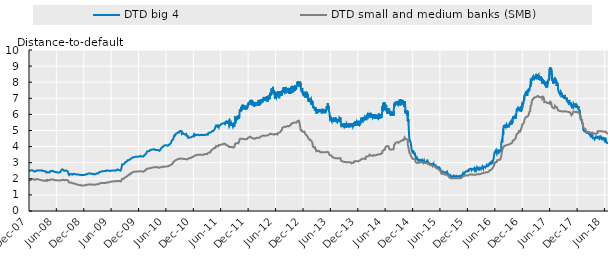
| Category | DTD big 4 | DTD small and medium banks (SMB) |
|---|---|---|
| 2007-12-31 | 2.468 | 1.886 |
| 2008-01-01 | 2.478 | 1.892 |
| 2008-01-02 | 2.49 | 1.893 |
| 2008-01-03 | 2.508 | 1.897 |
| 2008-01-04 | 2.509 | 1.9 |
| 2008-01-07 | 2.51 | 1.901 |
| 2008-01-08 | 2.519 | 1.912 |
| 2008-01-09 | 2.52 | 1.918 |
| 2008-01-10 | 2.529 | 1.926 |
| 2008-01-11 | 2.526 | 1.94 |
| 2008-01-14 | 2.529 | 1.942 |
| 2008-01-15 | 2.546 | 1.94 |
| 2008-01-16 | 2.539 | 1.954 |
| 2008-01-17 | 2.539 | 1.968 |
| 2008-01-18 | 2.542 | 1.975 |
| 2008-01-21 | 2.532 | 1.986 |
| 2008-01-22 | 2.498 | 1.968 |
| 2008-01-23 | 2.505 | 1.964 |
| 2008-01-24 | 2.515 | 1.976 |
| 2008-01-25 | 2.528 | 1.995 |
| 2008-01-28 | 2.492 | 1.979 |
| 2008-01-29 | 2.492 | 1.979 |
| 2008-01-30 | 2.489 | 1.968 |
| 2008-01-31 | 2.492 | 1.979 |
| 2008-02-01 | 2.488 | 1.978 |
| 2008-02-04 | 2.453 | 1.943 |
| 2008-02-05 | 2.459 | 1.944 |
| 2008-02-06 | 2.458 | 1.946 |
| 2008-02-07 | 2.459 | 1.947 |
| 2008-02-08 | 2.459 | 1.947 |
| 2008-02-11 | 2.459 | 1.947 |
| 2008-02-12 | 2.459 | 1.946 |
| 2008-02-13 | 2.455 | 1.939 |
| 2008-02-14 | 2.454 | 1.947 |
| 2008-02-15 | 2.5 | 1.985 |
| 2008-02-18 | 2.514 | 1.988 |
| 2008-02-19 | 2.516 | 1.99 |
| 2008-02-20 | 2.509 | 1.97 |
| 2008-02-21 | 2.51 | 1.97 |
| 2008-02-22 | 2.517 | 1.969 |
| 2008-02-25 | 2.509 | 1.966 |
| 2008-02-26 | 2.503 | 1.963 |
| 2008-02-27 | 2.506 | 1.957 |
| 2008-02-28 | 2.506 | 1.959 |
| 2008-02-29 | 2.508 | 1.958 |
| 2008-03-03 | 2.512 | 1.961 |
| 2008-03-04 | 2.506 | 1.946 |
| 2008-03-05 | 2.506 | 1.948 |
| 2008-03-06 | 2.528 | 1.967 |
| 2008-03-07 | 2.527 | 1.967 |
| 2008-03-10 | 2.521 | 1.948 |
| 2008-03-11 | 2.522 | 1.947 |
| 2008-03-12 | 2.519 | 1.936 |
| 2008-03-13 | 2.51 | 1.934 |
| 2008-03-14 | 2.509 | 1.931 |
| 2008-03-17 | 2.508 | 1.937 |
| 2008-03-18 | 2.533 | 1.939 |
| 2008-03-19 | 2.529 | 1.934 |
| 2008-03-20 | 2.532 | 1.929 |
| 2008-03-21 | 2.531 | 1.928 |
| 2008-03-24 | 2.528 | 1.907 |
| 2008-03-25 | 2.521 | 1.903 |
| 2008-03-26 | 2.523 | 1.901 |
| 2008-03-27 | 2.52 | 1.9 |
| 2008-03-28 | 2.494 | 1.882 |
| 2008-03-31 | 2.492 | 1.886 |
| 2008-04-01 | 2.489 | 1.887 |
| 2008-04-02 | 2.483 | 1.884 |
| 2008-04-03 | 2.479 | 1.89 |
| 2008-04-04 | 2.479 | 1.893 |
| 2008-04-07 | 2.48 | 1.892 |
| 2008-04-08 | 2.492 | 1.9 |
| 2008-04-09 | 2.479 | 1.887 |
| 2008-04-10 | 2.479 | 1.889 |
| 2008-04-11 | 2.479 | 1.89 |
| 2008-04-14 | 2.471 | 1.869 |
| 2008-04-15 | 2.47 | 1.919 |
| 2008-04-16 | 2.472 | 1.919 |
| 2008-04-17 | 2.469 | 1.919 |
| 2008-04-18 | 2.463 | 1.913 |
| 2008-04-21 | 2.454 | 1.913 |
| 2008-04-22 | 2.451 | 1.904 |
| 2008-04-23 | 2.446 | 1.892 |
| 2008-04-24 | 2.391 | 1.854 |
| 2008-04-25 | 2.379 | 1.854 |
| 2008-04-28 | 2.41 | 1.868 |
| 2008-04-29 | 2.408 | 1.868 |
| 2008-04-30 | 2.4 | 1.855 |
| 2008-05-01 | 2.401 | 1.93 |
| 2008-05-02 | 2.416 | 1.941 |
| 2008-05-05 | 2.416 | 1.941 |
| 2008-05-06 | 2.412 | 1.937 |
| 2008-05-07 | 2.406 | 1.928 |
| 2008-05-08 | 2.405 | 1.928 |
| 2008-05-09 | 2.402 | 1.918 |
| 2008-05-12 | 2.403 | 1.919 |
| 2008-05-13 | 2.401 | 1.917 |
| 2008-05-14 | 2.397 | 1.908 |
| 2008-05-15 | 2.396 | 1.906 |
| 2008-05-16 | 2.397 | 1.905 |
| 2008-05-19 | 2.425 | 1.924 |
| 2008-05-20 | 2.43 | 1.932 |
| 2008-05-21 | 2.43 | 1.934 |
| 2008-05-22 | 2.491 | 1.958 |
| 2008-05-23 | 2.494 | 1.962 |
| 2008-05-26 | 2.489 | 1.958 |
| 2008-05-27 | 2.489 | 1.957 |
| 2008-05-28 | 2.486 | 1.955 |
| 2008-05-29 | 2.484 | 1.953 |
| 2008-05-30 | 2.484 | 1.952 |
| 2008-06-02 | 2.497 | 1.956 |
| 2008-06-03 | 2.503 | 1.96 |
| 2008-06-04 | 2.501 | 1.961 |
| 2008-06-05 | 2.503 | 1.967 |
| 2008-06-06 | 2.503 | 1.969 |
| 2008-06-09 | 2.508 | 1.976 |
| 2008-06-10 | 2.454 | 1.934 |
| 2008-06-11 | 2.456 | 1.931 |
| 2008-06-12 | 2.455 | 1.932 |
| 2008-06-13 | 2.453 | 1.932 |
| 2008-06-16 | 2.455 | 1.937 |
| 2008-06-17 | 2.458 | 1.938 |
| 2008-06-18 | 2.452 | 1.934 |
| 2008-06-19 | 2.425 | 1.912 |
| 2008-06-20 | 2.419 | 1.909 |
| 2008-06-23 | 2.419 | 1.908 |
| 2008-06-24 | 2.423 | 1.913 |
| 2008-06-25 | 2.425 | 1.916 |
| 2008-06-26 | 2.427 | 1.921 |
| 2008-06-27 | 2.406 | 1.915 |
| 2008-06-30 | 2.406 | 1.914 |
| 2008-07-01 | 2.402 | 1.901 |
| 2008-07-02 | 2.402 | 1.902 |
| 2008-07-03 | 2.405 | 1.904 |
| 2008-07-04 | 2.408 | 1.915 |
| 2008-07-07 | 2.398 | 1.899 |
| 2008-07-08 | 2.398 | 1.899 |
| 2008-07-09 | 2.391 | 1.904 |
| 2008-07-10 | 2.395 | 1.907 |
| 2008-07-11 | 2.395 | 1.904 |
| 2008-07-14 | 2.4 | 1.921 |
| 2008-07-15 | 2.393 | 1.91 |
| 2008-07-16 | 2.39 | 1.904 |
| 2008-07-17 | 2.392 | 1.902 |
| 2008-07-18 | 2.387 | 1.891 |
| 2008-07-21 | 2.393 | 1.892 |
| 2008-07-22 | 2.392 | 1.899 |
| 2008-07-23 | 2.403 | 1.912 |
| 2008-07-24 | 2.399 | 1.906 |
| 2008-07-25 | 2.399 | 1.903 |
| 2008-07-28 | 2.457 | 1.906 |
| 2008-07-29 | 2.457 | 1.906 |
| 2008-07-30 | 2.459 | 1.91 |
| 2008-07-31 | 2.506 | 1.91 |
| 2008-08-01 | 2.505 | 1.906 |
| 2008-08-04 | 2.502 | 1.907 |
| 2008-08-05 | 2.517 | 1.914 |
| 2008-08-06 | 2.526 | 1.915 |
| 2008-08-07 | 2.586 | 1.936 |
| 2008-08-08 | 2.577 | 1.932 |
| 2008-08-11 | 2.568 | 1.929 |
| 2008-08-12 | 2.569 | 1.931 |
| 2008-08-13 | 2.565 | 1.937 |
| 2008-08-14 | 2.564 | 1.946 |
| 2008-08-15 | 2.569 | 1.947 |
| 2008-08-18 | 2.561 | 1.942 |
| 2008-08-19 | 2.564 | 1.94 |
| 2008-08-20 | 2.506 | 1.912 |
| 2008-08-21 | 2.498 | 1.906 |
| 2008-08-22 | 2.498 | 1.902 |
| 2008-08-25 | 2.498 | 1.903 |
| 2008-08-26 | 2.502 | 1.906 |
| 2008-08-27 | 2.505 | 1.909 |
| 2008-08-28 | 2.505 | 1.92 |
| 2008-08-29 | 2.524 | 1.936 |
| 2008-09-01 | 2.517 | 1.929 |
| 2008-09-02 | 2.516 | 1.932 |
| 2008-09-03 | 2.516 | 1.929 |
| 2008-09-04 | 2.518 | 1.93 |
| 2008-09-05 | 2.511 | 1.928 |
| 2008-09-08 | 2.511 | 1.928 |
| 2008-09-09 | 2.513 | 1.929 |
| 2008-09-10 | 2.513 | 1.93 |
| 2008-09-11 | 2.485 | 1.922 |
| 2008-09-12 | 2.506 | 1.922 |
| 2008-09-15 | 2.501 | 1.922 |
| 2008-09-16 | 2.438 | 1.884 |
| 2008-09-17 | 2.399 | 1.86 |
| 2008-09-18 | 2.38 | 1.854 |
| 2008-09-19 | 2.308 | 1.811 |
| 2008-09-22 | 2.249 | 1.77 |
| 2008-09-23 | 2.234 | 1.76 |
| 2008-09-24 | 2.247 | 1.758 |
| 2008-09-25 | 2.277 | 1.761 |
| 2008-09-26 | 2.274 | 1.764 |
| 2008-09-29 | 2.291 | 1.766 |
| 2008-09-30 | 2.286 | 1.779 |
| 2008-10-01 | 2.291 | 1.78 |
| 2008-10-02 | 2.292 | 1.784 |
| 2008-10-03 | 2.318 | 1.785 |
| 2008-10-06 | 2.293 | 1.763 |
| 2008-10-07 | 2.298 | 1.764 |
| 2008-10-08 | 2.281 | 1.753 |
| 2008-10-09 | 2.298 | 1.758 |
| 2008-10-10 | 2.306 | 1.759 |
| 2008-10-13 | 2.267 | 1.728 |
| 2008-10-14 | 2.258 | 1.73 |
| 2008-10-15 | 2.27 | 1.732 |
| 2008-10-16 | 2.273 | 1.731 |
| 2008-10-17 | 2.292 | 1.733 |
| 2008-10-20 | 2.294 | 1.728 |
| 2008-10-21 | 2.311 | 1.73 |
| 2008-10-22 | 2.305 | 1.73 |
| 2008-10-23 | 2.303 | 1.727 |
| 2008-10-24 | 2.301 | 1.719 |
| 2008-10-27 | 2.298 | 1.699 |
| 2008-10-28 | 2.293 | 1.69 |
| 2008-10-29 | 2.282 | 1.691 |
| 2008-10-30 | 2.279 | 1.69 |
| 2008-10-31 | 2.289 | 1.691 |
| 2008-11-03 | 2.3 | 1.692 |
| 2008-11-04 | 2.287 | 1.69 |
| 2008-11-05 | 2.285 | 1.684 |
| 2008-11-06 | 2.297 | 1.677 |
| 2008-11-07 | 2.282 | 1.672 |
| 2008-11-10 | 2.257 | 1.653 |
| 2008-11-11 | 2.268 | 1.653 |
| 2008-11-12 | 2.275 | 1.654 |
| 2008-11-13 | 2.269 | 1.651 |
| 2008-11-14 | 2.252 | 1.649 |
| 2008-11-17 | 2.265 | 1.65 |
| 2008-11-18 | 2.275 | 1.641 |
| 2008-11-19 | 2.271 | 1.624 |
| 2008-11-20 | 2.274 | 1.623 |
| 2008-11-21 | 2.26 | 1.625 |
| 2008-11-24 | 2.273 | 1.62 |
| 2008-11-25 | 2.257 | 1.621 |
| 2008-11-26 | 2.263 | 1.622 |
| 2008-11-27 | 2.259 | 1.62 |
| 2008-11-28 | 2.25 | 1.615 |
| 2008-12-01 | 2.25 | 1.617 |
| 2008-12-02 | 2.257 | 1.618 |
| 2008-12-03 | 2.239 | 1.61 |
| 2008-12-04 | 2.249 | 1.614 |
| 2008-12-05 | 2.254 | 1.612 |
| 2008-12-08 | 2.251 | 1.604 |
| 2008-12-09 | 2.238 | 1.607 |
| 2008-12-10 | 2.24 | 1.596 |
| 2008-12-11 | 2.238 | 1.593 |
| 2008-12-12 | 2.236 | 1.588 |
| 2008-12-15 | 2.225 | 1.587 |
| 2008-12-16 | 2.235 | 1.591 |
| 2008-12-17 | 2.232 | 1.592 |
| 2008-12-18 | 2.236 | 1.583 |
| 2008-12-19 | 2.24 | 1.582 |
| 2008-12-22 | 2.231 | 1.584 |
| 2008-12-23 | 2.232 | 1.582 |
| 2008-12-24 | 2.225 | 1.58 |
| 2008-12-25 | 2.229 | 1.582 |
| 2008-12-26 | 2.229 | 1.583 |
| 2008-12-29 | 2.226 | 1.581 |
| 2008-12-30 | 2.239 | 1.583 |
| 2008-12-31 | 2.235 | 1.589 |
| 2009-01-01 | 2.232 | 1.59 |
| 2009-01-02 | 2.246 | 1.592 |
| 2009-01-05 | 2.245 | 1.591 |
| 2009-01-06 | 2.244 | 1.589 |
| 2009-01-07 | 2.243 | 1.588 |
| 2009-01-08 | 2.24 | 1.592 |
| 2009-01-09 | 2.265 | 1.609 |
| 2009-01-12 | 2.284 | 1.611 |
| 2009-01-13 | 2.284 | 1.612 |
| 2009-01-14 | 2.279 | 1.605 |
| 2009-01-15 | 2.292 | 1.621 |
| 2009-01-16 | 2.285 | 1.62 |
| 2009-01-19 | 2.293 | 1.622 |
| 2009-01-20 | 2.281 | 1.621 |
| 2009-01-21 | 2.297 | 1.62 |
| 2009-01-22 | 2.325 | 1.646 |
| 2009-01-23 | 2.32 | 1.645 |
| 2009-01-26 | 2.333 | 1.644 |
| 2009-01-27 | 2.321 | 1.643 |
| 2009-01-28 | 2.33 | 1.644 |
| 2009-01-29 | 2.325 | 1.644 |
| 2009-01-30 | 2.33 | 1.643 |
| 2009-02-02 | 2.334 | 1.649 |
| 2009-02-03 | 2.326 | 1.643 |
| 2009-02-04 | 2.33 | 1.636 |
| 2009-02-05 | 2.325 | 1.641 |
| 2009-02-06 | 2.324 | 1.636 |
| 2009-02-09 | 2.333 | 1.641 |
| 2009-02-10 | 2.323 | 1.647 |
| 2009-02-11 | 2.323 | 1.649 |
| 2009-02-12 | 2.334 | 1.653 |
| 2009-02-13 | 2.327 | 1.652 |
| 2009-02-16 | 2.318 | 1.646 |
| 2009-02-17 | 2.326 | 1.646 |
| 2009-02-18 | 2.306 | 1.638 |
| 2009-02-19 | 2.309 | 1.642 |
| 2009-02-20 | 2.308 | 1.645 |
| 2009-02-23 | 2.312 | 1.643 |
| 2009-02-24 | 2.3 | 1.635 |
| 2009-02-25 | 2.296 | 1.629 |
| 2009-02-26 | 2.305 | 1.632 |
| 2009-02-27 | 2.296 | 1.632 |
| 2009-03-02 | 2.296 | 1.638 |
| 2009-03-03 | 2.302 | 1.636 |
| 2009-03-04 | 2.281 | 1.62 |
| 2009-03-05 | 2.282 | 1.623 |
| 2009-03-06 | 2.272 | 1.625 |
| 2009-03-09 | 2.271 | 1.626 |
| 2009-03-10 | 2.271 | 1.632 |
| 2009-03-11 | 2.265 | 1.628 |
| 2009-03-12 | 2.285 | 1.636 |
| 2009-03-13 | 2.284 | 1.637 |
| 2009-03-16 | 2.273 | 1.635 |
| 2009-03-17 | 2.287 | 1.634 |
| 2009-03-18 | 2.32 | 1.651 |
| 2009-03-19 | 2.322 | 1.653 |
| 2009-03-20 | 2.325 | 1.65 |
| 2009-03-23 | 2.321 | 1.659 |
| 2009-03-24 | 2.338 | 1.66 |
| 2009-03-25 | 2.321 | 1.66 |
| 2009-03-26 | 2.311 | 1.65 |
| 2009-03-27 | 2.321 | 1.65 |
| 2009-03-30 | 2.322 | 1.661 |
| 2009-03-31 | 2.327 | 1.666 |
| 2009-04-01 | 2.329 | 1.664 |
| 2009-04-02 | 2.339 | 1.677 |
| 2009-04-03 | 2.345 | 1.675 |
| 2009-04-06 | 2.344 | 1.674 |
| 2009-04-07 | 2.352 | 1.682 |
| 2009-04-08 | 2.348 | 1.678 |
| 2009-04-09 | 2.346 | 1.678 |
| 2009-04-10 | 2.353 | 1.684 |
| 2009-04-13 | 2.366 | 1.693 |
| 2009-04-14 | 2.426 | 1.721 |
| 2009-04-15 | 2.429 | 1.723 |
| 2009-04-16 | 2.428 | 1.725 |
| 2009-04-17 | 2.435 | 1.724 |
| 2009-04-20 | 2.451 | 1.734 |
| 2009-04-21 | 2.435 | 1.733 |
| 2009-04-22 | 2.451 | 1.73 |
| 2009-04-23 | 2.448 | 1.73 |
| 2009-04-24 | 2.448 | 1.731 |
| 2009-04-27 | 2.454 | 1.739 |
| 2009-04-28 | 2.458 | 1.738 |
| 2009-04-29 | 2.455 | 1.724 |
| 2009-04-30 | 2.46 | 1.724 |
| 2009-05-01 | 2.455 | 1.728 |
| 2009-05-04 | 2.46 | 1.736 |
| 2009-05-05 | 2.467 | 1.736 |
| 2009-05-06 | 2.458 | 1.736 |
| 2009-05-07 | 2.461 | 1.733 |
| 2009-05-08 | 2.46 | 1.739 |
| 2009-05-11 | 2.462 | 1.738 |
| 2009-05-12 | 2.47 | 1.738 |
| 2009-05-13 | 2.462 | 1.737 |
| 2009-05-14 | 2.481 | 1.741 |
| 2009-05-15 | 2.473 | 1.738 |
| 2009-05-18 | 2.481 | 1.745 |
| 2009-05-19 | 2.485 | 1.745 |
| 2009-05-20 | 2.478 | 1.743 |
| 2009-05-21 | 2.474 | 1.745 |
| 2009-05-22 | 2.473 | 1.744 |
| 2009-05-25 | 2.474 | 1.746 |
| 2009-05-26 | 2.484 | 1.744 |
| 2009-05-27 | 2.468 | 1.738 |
| 2009-05-28 | 2.485 | 1.739 |
| 2009-05-29 | 2.536 | 1.775 |
| 2009-06-01 | 2.526 | 1.773 |
| 2009-06-02 | 2.524 | 1.772 |
| 2009-06-03 | 2.506 | 1.761 |
| 2009-06-04 | 2.502 | 1.761 |
| 2009-06-05 | 2.501 | 1.763 |
| 2009-06-08 | 2.494 | 1.767 |
| 2009-06-09 | 2.511 | 1.786 |
| 2009-06-10 | 2.522 | 1.791 |
| 2009-06-11 | 2.526 | 1.791 |
| 2009-06-12 | 2.527 | 1.791 |
| 2009-06-15 | 2.494 | 1.782 |
| 2009-06-16 | 2.498 | 1.783 |
| 2009-06-17 | 2.525 | 1.793 |
| 2009-06-18 | 2.517 | 1.791 |
| 2009-06-19 | 2.516 | 1.801 |
| 2009-06-22 | 2.496 | 1.801 |
| 2009-06-23 | 2.487 | 1.8 |
| 2009-06-24 | 2.486 | 1.801 |
| 2009-06-25 | 2.492 | 1.815 |
| 2009-06-26 | 2.492 | 1.815 |
| 2009-06-29 | 2.504 | 1.822 |
| 2009-06-30 | 2.502 | 1.822 |
| 2009-07-01 | 2.501 | 1.817 |
| 2009-07-02 | 2.507 | 1.815 |
| 2009-07-03 | 2.51 | 1.827 |
| 2009-07-06 | 2.512 | 1.831 |
| 2009-07-07 | 2.515 | 1.832 |
| 2009-07-08 | 2.512 | 1.841 |
| 2009-07-09 | 2.516 | 1.84 |
| 2009-07-10 | 2.507 | 1.841 |
| 2009-07-13 | 2.507 | 1.84 |
| 2009-07-14 | 2.508 | 1.842 |
| 2009-07-15 | 2.518 | 1.842 |
| 2009-07-16 | 2.519 | 1.838 |
| 2009-07-17 | 2.511 | 1.841 |
| 2009-07-20 | 2.521 | 1.841 |
| 2009-07-21 | 2.516 | 1.843 |
| 2009-07-22 | 2.522 | 1.847 |
| 2009-07-23 | 2.523 | 1.843 |
| 2009-07-24 | 2.52 | 1.842 |
| 2009-07-27 | 2.522 | 1.844 |
| 2009-07-28 | 2.522 | 1.843 |
| 2009-07-29 | 2.524 | 1.85 |
| 2009-07-30 | 2.523 | 1.844 |
| 2009-07-31 | 2.518 | 1.844 |
| 2009-08-03 | 2.526 | 1.848 |
| 2009-08-04 | 2.521 | 1.844 |
| 2009-08-05 | 2.514 | 1.842 |
| 2009-08-06 | 2.526 | 1.847 |
| 2009-08-07 | 2.533 | 1.847 |
| 2009-08-10 | 2.585 | 1.873 |
| 2009-08-11 | 2.588 | 1.878 |
| 2009-08-12 | 2.577 | 1.874 |
| 2009-08-13 | 2.567 | 1.872 |
| 2009-08-14 | 2.568 | 1.869 |
| 2009-08-17 | 2.551 | 1.859 |
| 2009-08-18 | 2.548 | 1.858 |
| 2009-08-19 | 2.541 | 1.853 |
| 2009-08-20 | 2.54 | 1.855 |
| 2009-08-21 | 2.54 | 1.857 |
| 2009-08-24 | 2.536 | 1.858 |
| 2009-08-25 | 2.524 | 1.845 |
| 2009-08-26 | 2.54 | 1.851 |
| 2009-08-27 | 2.532 | 1.852 |
| 2009-08-28 | 2.537 | 1.844 |
| 2009-08-31 | 2.508 | 1.831 |
| 2009-09-01 | 2.517 | 1.839 |
| 2009-09-02 | 2.524 | 1.832 |
| 2009-09-03 | 2.502 | 1.829 |
| 2009-09-04 | 2.594 | 1.865 |
| 2009-09-07 | 2.675 | 1.9 |
| 2009-09-08 | 2.676 | 1.902 |
| 2009-09-09 | 2.77 | 1.945 |
| 2009-09-10 | 2.889 | 1.99 |
| 2009-09-11 | 2.885 | 1.999 |
| 2009-09-14 | 2.886 | 2 |
| 2009-09-15 | 2.896 | 2.003 |
| 2009-09-16 | 2.888 | 1.996 |
| 2009-09-17 | 2.894 | 1.999 |
| 2009-09-18 | 2.878 | 1.99 |
| 2009-09-21 | 2.868 | 1.989 |
| 2009-09-22 | 2.866 | 1.982 |
| 2009-09-23 | 2.877 | 1.983 |
| 2009-09-24 | 2.925 | 2.017 |
| 2009-09-25 | 2.922 | 2.017 |
| 2009-09-28 | 2.922 | 2.031 |
| 2009-09-29 | 2.927 | 2.031 |
| 2009-09-30 | 2.947 | 2.04 |
| 2009-10-01 | 3.019 | 2.085 |
| 2009-10-02 | 3.036 | 2.089 |
| 2009-10-05 | 3.025 | 2.094 |
| 2009-10-06 | 3.047 | 2.106 |
| 2009-10-07 | 3.061 | 2.104 |
| 2009-10-08 | 3.058 | 2.114 |
| 2009-10-09 | 3.048 | 2.109 |
| 2009-10-12 | 3.05 | 2.109 |
| 2009-10-13 | 3.068 | 2.115 |
| 2009-10-14 | 3.079 | 2.138 |
| 2009-10-15 | 3.094 | 2.182 |
| 2009-10-16 | 3.114 | 2.208 |
| 2009-10-19 | 3.158 | 2.21 |
| 2009-10-20 | 3.151 | 2.211 |
| 2009-10-21 | 3.165 | 2.217 |
| 2009-10-22 | 3.153 | 2.217 |
| 2009-10-23 | 3.152 | 2.21 |
| 2009-10-26 | 3.163 | 2.229 |
| 2009-10-27 | 3.149 | 2.232 |
| 2009-10-28 | 3.159 | 2.236 |
| 2009-10-29 | 3.212 | 2.278 |
| 2009-10-30 | 3.201 | 2.279 |
| 2009-11-02 | 3.203 | 2.269 |
| 2009-11-03 | 3.214 | 2.274 |
| 2009-11-04 | 3.211 | 2.276 |
| 2009-11-05 | 3.22 | 2.278 |
| 2009-11-06 | 3.242 | 2.328 |
| 2009-11-09 | 3.258 | 2.36 |
| 2009-11-10 | 3.268 | 2.367 |
| 2009-11-11 | 3.267 | 2.367 |
| 2009-11-12 | 3.301 | 2.386 |
| 2009-11-13 | 3.287 | 2.386 |
| 2009-11-16 | 3.283 | 2.379 |
| 2009-11-17 | 3.281 | 2.377 |
| 2009-11-18 | 3.302 | 2.402 |
| 2009-11-19 | 3.307 | 2.403 |
| 2009-11-20 | 3.306 | 2.4 |
| 2009-11-23 | 3.332 | 2.42 |
| 2009-11-24 | 3.328 | 2.411 |
| 2009-11-25 | 3.324 | 2.41 |
| 2009-11-26 | 3.303 | 2.415 |
| 2009-11-27 | 3.331 | 2.416 |
| 2009-11-30 | 3.339 | 2.439 |
| 2009-12-01 | 3.356 | 2.448 |
| 2009-12-02 | 3.372 | 2.469 |
| 2009-12-03 | 3.371 | 2.471 |
| 2009-12-04 | 3.349 | 2.442 |
| 2009-12-07 | 3.362 | 2.441 |
| 2009-12-08 | 3.358 | 2.453 |
| 2009-12-09 | 3.361 | 2.448 |
| 2009-12-10 | 3.369 | 2.453 |
| 2009-12-11 | 3.379 | 2.466 |
| 2009-12-14 | 3.364 | 2.453 |
| 2009-12-15 | 3.364 | 2.451 |
| 2009-12-16 | 3.367 | 2.451 |
| 2009-12-17 | 3.366 | 2.449 |
| 2009-12-18 | 3.364 | 2.446 |
| 2009-12-21 | 3.375 | 2.447 |
| 2009-12-22 | 3.361 | 2.441 |
| 2009-12-23 | 3.37 | 2.443 |
| 2009-12-24 | 3.356 | 2.454 |
| 2009-12-25 | 3.361 | 2.457 |
| 2009-12-28 | 3.377 | 2.455 |
| 2009-12-29 | 3.386 | 2.466 |
| 2009-12-30 | 3.389 | 2.45 |
| 2009-12-31 | 3.388 | 2.452 |
| 2010-01-01 | 3.403 | 2.456 |
| 2010-01-04 | 3.391 | 2.472 |
| 2010-01-05 | 3.418 | 2.471 |
| 2010-01-06 | 3.415 | 2.473 |
| 2010-01-07 | 3.426 | 2.474 |
| 2010-01-08 | 3.432 | 2.475 |
| 2010-01-11 | 3.422 | 2.476 |
| 2010-01-12 | 3.423 | 2.476 |
| 2010-01-13 | 3.384 | 2.448 |
| 2010-01-14 | 3.38 | 2.451 |
| 2010-01-15 | 3.39 | 2.45 |
| 2010-01-18 | 3.385 | 2.452 |
| 2010-01-19 | 3.386 | 2.451 |
| 2010-01-20 | 3.374 | 2.442 |
| 2010-01-21 | 3.365 | 2.436 |
| 2010-01-22 | 3.378 | 2.436 |
| 2010-01-25 | 3.379 | 2.451 |
| 2010-01-26 | 3.372 | 2.45 |
| 2010-01-27 | 3.403 | 2.447 |
| 2010-01-28 | 3.388 | 2.447 |
| 2010-01-29 | 3.395 | 2.445 |
| 2010-02-01 | 3.395 | 2.442 |
| 2010-02-02 | 3.401 | 2.451 |
| 2010-02-03 | 3.392 | 2.447 |
| 2010-02-04 | 3.422 | 2.463 |
| 2010-02-05 | 3.438 | 2.469 |
| 2010-02-08 | 3.492 | 2.492 |
| 2010-02-09 | 3.489 | 2.49 |
| 2010-02-10 | 3.483 | 2.491 |
| 2010-02-11 | 3.491 | 2.501 |
| 2010-02-12 | 3.531 | 2.536 |
| 2010-02-15 | 3.521 | 2.548 |
| 2010-02-16 | 3.531 | 2.56 |
| 2010-02-17 | 3.547 | 2.56 |
| 2010-02-18 | 3.534 | 2.564 |
| 2010-02-19 | 3.547 | 2.569 |
| 2010-02-22 | 3.642 | 2.616 |
| 2010-02-23 | 3.653 | 2.619 |
| 2010-02-24 | 3.665 | 2.622 |
| 2010-02-25 | 3.706 | 2.627 |
| 2010-02-26 | 3.701 | 2.627 |
| 2010-03-01 | 3.709 | 2.629 |
| 2010-03-02 | 3.709 | 2.634 |
| 2010-03-03 | 3.703 | 2.634 |
| 2010-03-04 | 3.711 | 2.638 |
| 2010-03-05 | 3.716 | 2.647 |
| 2010-03-08 | 3.716 | 2.652 |
| 2010-03-09 | 3.717 | 2.647 |
| 2010-03-10 | 3.714 | 2.652 |
| 2010-03-11 | 3.718 | 2.654 |
| 2010-03-12 | 3.723 | 2.652 |
| 2010-03-15 | 3.715 | 2.649 |
| 2010-03-16 | 3.788 | 2.672 |
| 2010-03-17 | 3.788 | 2.672 |
| 2010-03-18 | 3.793 | 2.671 |
| 2010-03-19 | 3.778 | 2.673 |
| 2010-03-22 | 3.8 | 2.671 |
| 2010-03-23 | 3.802 | 2.675 |
| 2010-03-24 | 3.792 | 2.689 |
| 2010-03-25 | 3.798 | 2.688 |
| 2010-03-26 | 3.804 | 2.683 |
| 2010-03-29 | 3.818 | 2.691 |
| 2010-03-30 | 3.815 | 2.695 |
| 2010-03-31 | 3.816 | 2.702 |
| 2010-04-01 | 3.829 | 2.704 |
| 2010-04-02 | 3.822 | 2.704 |
| 2010-04-05 | 3.83 | 2.704 |
| 2010-04-06 | 3.823 | 2.706 |
| 2010-04-07 | 3.834 | 2.709 |
| 2010-04-08 | 3.827 | 2.711 |
| 2010-04-09 | 3.827 | 2.717 |
| 2010-04-12 | 3.833 | 2.722 |
| 2010-04-13 | 3.838 | 2.716 |
| 2010-04-14 | 3.828 | 2.718 |
| 2010-04-15 | 3.844 | 2.726 |
| 2010-04-16 | 3.82 | 2.717 |
| 2010-04-19 | 3.796 | 2.723 |
| 2010-04-20 | 3.791 | 2.725 |
| 2010-04-21 | 3.784 | 2.721 |
| 2010-04-22 | 3.775 | 2.714 |
| 2010-04-23 | 3.778 | 2.716 |
| 2010-04-26 | 3.788 | 2.716 |
| 2010-04-27 | 3.79 | 2.717 |
| 2010-04-28 | 3.782 | 2.727 |
| 2010-04-29 | 3.81 | 2.728 |
| 2010-04-30 | 3.792 | 2.731 |
| 2010-05-03 | 3.772 | 2.735 |
| 2010-05-04 | 3.791 | 2.735 |
| 2010-05-05 | 3.795 | 2.733 |
| 2010-05-06 | 3.767 | 2.693 |
| 2010-05-07 | 3.779 | 2.694 |
| 2010-05-10 | 3.785 | 2.691 |
| 2010-05-11 | 3.773 | 2.691 |
| 2010-05-12 | 3.765 | 2.681 |
| 2010-05-13 | 3.757 | 2.675 |
| 2010-05-14 | 3.772 | 2.679 |
| 2010-05-17 | 3.752 | 2.681 |
| 2010-05-18 | 3.741 | 2.673 |
| 2010-05-19 | 3.759 | 2.669 |
| 2010-05-20 | 3.781 | 2.686 |
| 2010-05-21 | 3.768 | 2.681 |
| 2010-05-24 | 3.81 | 2.721 |
| 2010-05-25 | 3.813 | 2.716 |
| 2010-05-26 | 3.811 | 2.719 |
| 2010-05-27 | 3.873 | 2.726 |
| 2010-05-28 | 3.87 | 2.725 |
| 2010-05-31 | 3.859 | 2.72 |
| 2010-06-01 | 3.87 | 2.723 |
| 2010-06-02 | 3.86 | 2.724 |
| 2010-06-03 | 3.953 | 2.763 |
| 2010-06-04 | 3.945 | 2.76 |
| 2010-06-07 | 3.932 | 2.757 |
| 2010-06-08 | 3.952 | 2.761 |
| 2010-06-09 | 3.948 | 2.728 |
| 2010-06-10 | 3.977 | 2.723 |
| 2010-06-11 | 4.034 | 2.727 |
| 2010-06-14 | 4.036 | 2.734 |
| 2010-06-15 | 4.053 | 2.735 |
| 2010-06-16 | 4.055 | 2.737 |
| 2010-06-17 | 4.055 | 2.744 |
| 2010-06-18 | 4.078 | 2.744 |
| 2010-06-21 | 4.065 | 2.751 |
| 2010-06-22 | 4.079 | 2.755 |
| 2010-06-23 | 4.077 | 2.759 |
| 2010-06-24 | 4.081 | 2.763 |
| 2010-06-25 | 4.089 | 2.77 |
| 2010-06-28 | 4.107 | 2.771 |
| 2010-06-29 | 4.086 | 2.748 |
| 2010-06-30 | 4.078 | 2.748 |
| 2010-07-01 | 4.091 | 2.754 |
| 2010-07-02 | 4.097 | 2.771 |
| 2010-07-05 | 4.082 | 2.77 |
| 2010-07-06 | 4.07 | 2.779 |
| 2010-07-07 | 4.074 | 2.777 |
| 2010-07-08 | 4.065 | 2.775 |
| 2010-07-09 | 4.037 | 2.771 |
| 2010-07-12 | 4.049 | 2.773 |
| 2010-07-13 | 4.052 | 2.786 |
| 2010-07-14 | 4.051 | 2.792 |
| 2010-07-15 | 4.064 | 2.793 |
| 2010-07-16 | 4.041 | 2.791 |
| 2010-07-19 | 4.051 | 2.799 |
| 2010-07-20 | 4.122 | 2.827 |
| 2010-07-21 | 4.128 | 2.827 |
| 2010-07-22 | 4.12 | 2.826 |
| 2010-07-23 | 4.134 | 2.832 |
| 2010-07-26 | 4.134 | 2.838 |
| 2010-07-27 | 4.155 | 2.842 |
| 2010-07-28 | 4.14 | 2.839 |
| 2010-07-29 | 4.167 | 2.844 |
| 2010-07-30 | 4.132 | 2.842 |
| 2010-08-02 | 4.19 | 2.856 |
| 2010-08-03 | 4.232 | 2.856 |
| 2010-08-04 | 4.24 | 2.868 |
| 2010-08-05 | 4.312 | 2.893 |
| 2010-08-06 | 4.323 | 2.892 |
| 2010-08-09 | 4.325 | 2.912 |
| 2010-08-10 | 4.373 | 2.925 |
| 2010-08-11 | 4.411 | 2.925 |
| 2010-08-12 | 4.391 | 2.923 |
| 2010-08-13 | 4.446 | 2.972 |
| 2010-08-16 | 4.428 | 2.971 |
| 2010-08-17 | 4.445 | 2.97 |
| 2010-08-18 | 4.452 | 2.992 |
| 2010-08-19 | 4.55 | 3.05 |
| 2010-08-20 | 4.565 | 3.061 |
| 2010-08-23 | 4.617 | 3.083 |
| 2010-08-24 | 4.693 | 3.108 |
| 2010-08-25 | 4.682 | 3.096 |
| 2010-08-26 | 4.658 | 3.097 |
| 2010-08-27 | 4.693 | 3.109 |
| 2010-08-30 | 4.708 | 3.108 |
| 2010-08-31 | 4.686 | 3.104 |
| 2010-09-01 | 4.752 | 3.145 |
| 2010-09-02 | 4.77 | 3.151 |
| 2010-09-03 | 4.765 | 3.152 |
| 2010-09-06 | 4.783 | 3.153 |
| 2010-09-07 | 4.818 | 3.156 |
| 2010-09-08 | 4.819 | 3.175 |
| 2010-09-09 | 4.843 | 3.177 |
| 2010-09-10 | 4.844 | 3.187 |
| 2010-09-13 | 4.822 | 3.19 |
| 2010-09-14 | 4.837 | 3.215 |
| 2010-09-15 | 4.843 | 3.215 |
| 2010-09-16 | 4.87 | 3.22 |
| 2010-09-17 | 4.895 | 3.225 |
| 2010-09-20 | 4.881 | 3.224 |
| 2010-09-21 | 4.893 | 3.226 |
| 2010-09-22 | 4.881 | 3.224 |
| 2010-09-23 | 4.867 | 3.227 |
| 2010-09-24 | 4.895 | 3.225 |
| 2010-09-27 | 4.875 | 3.223 |
| 2010-09-28 | 4.871 | 3.218 |
| 2010-09-29 | 4.933 | 3.26 |
| 2010-09-30 | 4.956 | 3.252 |
| 2010-10-01 | 4.956 | 3.264 |
| 2010-10-04 | 4.973 | 3.262 |
| 2010-10-05 | 4.967 | 3.262 |
| 2010-10-06 | 4.94 | 3.266 |
| 2010-10-07 | 4.973 | 3.273 |
| 2010-10-08 | 4.973 | 3.263 |
| 2010-10-11 | 4.942 | 3.249 |
| 2010-10-12 | 4.971 | 3.245 |
| 2010-10-13 | 4.962 | 3.244 |
| 2010-10-14 | 4.942 | 3.248 |
| 2010-10-15 | 4.789 | 3.2 |
| 2010-10-18 | 4.769 | 3.199 |
| 2010-10-19 | 4.797 | 3.211 |
| 2010-10-20 | 4.802 | 3.215 |
| 2010-10-21 | 4.847 | 3.239 |
| 2010-10-22 | 4.83 | 3.239 |
| 2010-10-25 | 4.82 | 3.234 |
| 2010-10-26 | 4.805 | 3.239 |
| 2010-10-27 | 4.828 | 3.232 |
| 2010-10-28 | 4.806 | 3.232 |
| 2010-10-29 | 4.782 | 3.221 |
| 2010-11-01 | 4.795 | 3.225 |
| 2010-11-02 | 4.761 | 3.227 |
| 2010-11-03 | 4.752 | 3.221 |
| 2010-11-04 | 4.775 | 3.231 |
| 2010-11-05 | 4.746 | 3.239 |
| 2010-11-08 | 4.757 | 3.232 |
| 2010-11-09 | 4.742 | 3.229 |
| 2010-11-10 | 4.78 | 3.216 |
| 2010-11-11 | 4.776 | 3.213 |
| 2010-11-12 | 4.785 | 3.172 |
| 2010-11-15 | 4.671 | 3.17 |
| 2010-11-16 | 4.654 | 3.19 |
| 2010-11-17 | 4.657 | 3.202 |
| 2010-11-18 | 4.69 | 3.206 |
| 2010-11-19 | 4.688 | 3.21 |
| 2010-11-22 | 4.658 | 3.199 |
| 2010-11-23 | 4.674 | 3.2 |
| 2010-11-24 | 4.55 | 3.254 |
| 2010-11-25 | 4.562 | 3.246 |
| 2010-11-26 | 4.573 | 3.25 |
| 2010-11-29 | 4.589 | 3.262 |
| 2010-11-30 | 4.572 | 3.259 |
| 2010-12-01 | 4.562 | 3.259 |
| 2010-12-02 | 4.558 | 3.283 |
| 2010-12-03 | 4.546 | 3.283 |
| 2010-12-06 | 4.554 | 3.282 |
| 2010-12-07 | 4.568 | 3.288 |
| 2010-12-08 | 4.564 | 3.291 |
| 2010-12-09 | 4.562 | 3.289 |
| 2010-12-10 | 4.585 | 3.303 |
| 2010-12-13 | 4.573 | 3.291 |
| 2010-12-14 | 4.575 | 3.304 |
| 2010-12-15 | 4.58 | 3.309 |
| 2010-12-16 | 4.582 | 3.314 |
| 2010-12-17 | 4.604 | 3.321 |
| 2010-12-20 | 4.608 | 3.366 |
| 2010-12-21 | 4.635 | 3.356 |
| 2010-12-22 | 4.619 | 3.349 |
| 2010-12-23 | 4.637 | 3.354 |
| 2010-12-24 | 4.645 | 3.36 |
| 2010-12-27 | 4.629 | 3.362 |
| 2010-12-28 | 4.643 | 3.374 |
| 2010-12-29 | 4.629 | 3.374 |
| 2010-12-30 | 4.637 | 3.374 |
| 2010-12-31 | 4.654 | 3.373 |
| 2011-01-03 | 4.753 | 3.43 |
| 2011-01-04 | 4.74 | 3.431 |
| 2011-01-05 | 4.735 | 3.431 |
| 2011-01-06 | 4.742 | 3.43 |
| 2011-01-07 | 4.677 | 3.411 |
| 2011-01-10 | 4.692 | 3.422 |
| 2011-01-11 | 4.711 | 3.425 |
| 2011-01-12 | 4.742 | 3.446 |
| 2011-01-13 | 4.735 | 3.458 |
| 2011-01-14 | 4.733 | 3.465 |
| 2011-01-17 | 4.717 | 3.467 |
| 2011-01-18 | 4.692 | 3.471 |
| 2011-01-19 | 4.704 | 3.475 |
| 2011-01-20 | 4.686 | 3.469 |
| 2011-01-21 | 4.715 | 3.463 |
| 2011-01-24 | 4.73 | 3.49 |
| 2011-01-25 | 4.71 | 3.489 |
| 2011-01-26 | 4.734 | 3.489 |
| 2011-01-27 | 4.747 | 3.499 |
| 2011-01-28 | 4.733 | 3.494 |
| 2011-01-31 | 4.721 | 3.504 |
| 2011-02-01 | 4.706 | 3.503 |
| 2011-02-02 | 4.734 | 3.5 |
| 2011-02-03 | 4.725 | 3.499 |
| 2011-02-04 | 4.707 | 3.503 |
| 2011-02-07 | 4.739 | 3.5 |
| 2011-02-08 | 4.716 | 3.502 |
| 2011-02-09 | 4.707 | 3.496 |
| 2011-02-10 | 4.716 | 3.499 |
| 2011-02-11 | 4.707 | 3.501 |
| 2011-02-14 | 4.714 | 3.479 |
| 2011-02-15 | 4.719 | 3.49 |
| 2011-02-16 | 4.715 | 3.494 |
| 2011-02-17 | 4.722 | 3.5 |
| 2011-02-18 | 4.72 | 3.5 |
| 2011-02-21 | 4.714 | 3.499 |
| 2011-02-22 | 4.74 | 3.496 |
| 2011-02-23 | 4.736 | 3.495 |
| 2011-02-24 | 4.703 | 3.499 |
| 2011-02-25 | 4.717 | 3.503 |
| 2011-02-28 | 4.731 | 3.5 |
| 2011-03-01 | 4.732 | 3.5 |
| 2011-03-02 | 4.722 | 3.499 |
| 2011-03-03 | 4.726 | 3.497 |
| 2011-03-04 | 4.714 | 3.501 |
| 2011-03-07 | 4.742 | 3.508 |
| 2011-03-08 | 4.733 | 3.507 |
| 2011-03-09 | 4.725 | 3.508 |
| 2011-03-10 | 4.692 | 3.496 |
| 2011-03-11 | 4.707 | 3.494 |
| 2011-03-14 | 4.712 | 3.494 |
| 2011-03-15 | 4.71 | 3.496 |
| 2011-03-16 | 4.711 | 3.505 |
| 2011-03-17 | 4.768 | 3.539 |
| 2011-03-18 | 4.767 | 3.537 |
| 2011-03-21 | 4.738 | 3.537 |
| 2011-03-22 | 4.738 | 3.531 |
| 2011-03-23 | 4.751 | 3.529 |
| 2011-03-24 | 4.757 | 3.535 |
| 2011-03-25 | 4.743 | 3.521 |
| 2011-03-28 | 4.733 | 3.523 |
| 2011-03-29 | 4.725 | 3.518 |
| 2011-03-30 | 4.737 | 3.52 |
| 2011-03-31 | 4.736 | 3.53 |
| 2011-04-01 | 4.733 | 3.523 |
| 2011-04-04 | 4.745 | 3.523 |
| 2011-04-05 | 4.749 | 3.523 |
| 2011-04-06 | 4.748 | 3.504 |
| 2011-04-07 | 4.828 | 3.608 |
| 2011-04-08 | 4.83 | 3.607 |
| 2011-04-11 | 4.837 | 3.612 |
| 2011-04-12 | 4.867 | 3.638 |
| 2011-04-13 | 4.869 | 3.627 |
| 2011-04-14 | 4.87 | 3.632 |
| 2011-04-15 | 4.865 | 3.637 |
| 2011-04-18 | 4.853 | 3.64 |
| 2011-04-19 | 4.848 | 3.629 |
| 2011-04-20 | 4.851 | 3.636 |
| 2011-04-21 | 4.878 | 3.633 |
| 2011-04-22 | 4.861 | 3.646 |
| 2011-04-25 | 4.862 | 3.654 |
| 2011-04-26 | 4.877 | 3.741 |
| 2011-04-27 | 4.868 | 3.748 |
| 2011-04-28 | 4.89 | 3.758 |
| 2011-04-29 | 4.875 | 3.762 |
| 2011-05-02 | 4.926 | 3.79 |
| 2011-05-03 | 4.932 | 3.802 |
| 2011-05-04 | 4.919 | 3.795 |
| 2011-05-05 | 4.973 | 3.831 |
| 2011-05-06 | 4.98 | 3.847 |
| 2011-05-09 | 4.983 | 3.854 |
| 2011-05-10 | 4.969 | 3.853 |
| 2011-05-11 | 4.999 | 3.861 |
| 2011-05-12 | 4.977 | 3.882 |
| 2011-05-13 | 5.019 | 3.909 |
| 2011-05-16 | 5 | 3.906 |
| 2011-05-17 | 5.026 | 3.908 |
| 2011-05-18 | 5.047 | 3.902 |
| 2011-05-19 | 5.073 | 3.923 |
| 2011-05-20 | 5.07 | 3.925 |
| 2011-05-23 | 5.126 | 3.913 |
| 2011-05-24 | 5.129 | 3.909 |
| 2011-05-25 | 5.211 | 3.901 |
| 2011-05-26 | 5.243 | 3.937 |
| 2011-05-27 | 5.255 | 3.933 |
| 2011-05-30 | 5.3 | 4.035 |
| 2011-05-31 | 5.32 | 4.05 |
| 2011-06-01 | 5.293 | 4.045 |
| 2011-06-02 | 5.272 | 4.006 |
| 2011-06-03 | 5.286 | 4.001 |
| 2011-06-06 | 5.25 | 4.007 |
| 2011-06-07 | 5.256 | 4.002 |
| 2011-06-08 | 5.301 | 3.999 |
| 2011-06-09 | 5.362 | 4.031 |
| 2011-06-10 | 5.257 | 4.023 |
| 2011-06-13 | 5.222 | 4.024 |
| 2011-06-14 | 5.247 | 4.025 |
| 2011-06-15 | 5.222 | 4.021 |
| 2011-06-16 | 5.185 | 4.024 |
| 2011-06-17 | 5.284 | 4.102 |
| 2011-06-20 | 5.298 | 4.103 |
| 2011-06-21 | 5.299 | 4.103 |
| 2011-06-22 | 5.294 | 4.112 |
| 2011-06-23 | 5.262 | 4.108 |
| 2011-06-24 | 5.294 | 4.103 |
| 2011-06-27 | 5.285 | 4.1 |
| 2011-06-28 | 5.325 | 4.102 |
| 2011-06-29 | 5.356 | 4.111 |
| 2011-06-30 | 5.378 | 4.121 |
| 2011-07-01 | 5.381 | 4.117 |
| 2011-07-04 | 5.402 | 4.098 |
| 2011-07-05 | 5.43 | 4.126 |
| 2011-07-06 | 5.413 | 4.119 |
| 2011-07-07 | 5.405 | 4.145 |
| 2011-07-08 | 5.426 | 4.141 |
| 2011-07-11 | 5.428 | 4.14 |
| 2011-07-12 | 5.423 | 4.131 |
| 2011-07-13 | 5.437 | 4.126 |
| 2011-07-14 | 5.441 | 4.129 |
| 2011-07-15 | 5.422 | 4.135 |
| 2011-07-18 | 5.446 | 4.168 |
| 2011-07-19 | 5.464 | 4.156 |
| 2011-07-20 | 5.455 | 4.158 |
| 2011-07-21 | 5.454 | 4.165 |
| 2011-07-22 | 5.509 | 4.183 |
| 2011-07-25 | 5.479 | 4.169 |
| 2011-07-26 | 5.484 | 4.182 |
| 2011-07-27 | 5.494 | 4.196 |
| 2011-07-28 | 5.391 | 4.186 |
| 2011-07-29 | 5.416 | 4.172 |
| 2011-08-01 | 5.416 | 4.178 |
| 2011-08-02 | 5.416 | 4.179 |
| 2011-08-03 | 5.349 | 4.185 |
| 2011-08-04 | 5.599 | 4.197 |
| 2011-08-05 | 5.42 | 4.092 |
| 2011-08-08 | 5.366 | 4.066 |
| 2011-08-09 | 5.503 | 4.069 |
| 2011-08-10 | 5.492 | 4.072 |
| 2011-08-11 | 5.453 | 4.064 |
| 2011-08-12 | 5.419 | 4.066 |
| 2011-08-15 | 5.575 | 4.061 |
| 2011-08-16 | 5.401 | 4.053 |
| 2011-08-17 | 5.498 | 4.055 |
| 2011-08-18 | 5.497 | 4.048 |
| 2011-08-19 | 5.444 | 4.052 |
| 2011-08-22 | 5.528 | 4.05 |
| 2011-08-23 | 5.481 | 4.032 |
| 2011-08-24 | 5.608 | 4.033 |
| 2011-08-25 | 5.35 | 3.968 |
| 2011-08-26 | 5.272 | 3.969 |
| 2011-08-29 | 5.257 | 3.955 |
| 2011-08-30 | 5.329 | 3.963 |
| 2011-08-31 | 5.365 | 3.963 |
| 2011-09-01 | 5.293 | 3.972 |
| 2011-09-02 | 5.324 | 3.966 |
| 2011-09-05 | 5.245 | 3.969 |
| 2011-09-06 | 5.514 | 3.989 |
| 2011-09-07 | 5.54 | 3.973 |
| 2011-09-08 | 5.532 | 3.978 |
| 2011-09-09 | 5.436 | 3.978 |
| 2011-09-12 | 5.372 | 3.974 |
| 2011-09-13 | 5.414 | 3.97 |
| 2011-09-14 | 5.423 | 3.972 |
| 2011-09-15 | 5.329 | 3.966 |
| 2011-09-16 | 5.348 | 3.97 |
| 2011-09-19 | 5.279 | 3.963 |
| 2011-09-20 | 5.473 | 3.977 |
| 2011-09-21 | 5.284 | 3.963 |
| 2011-09-22 | 5.287 | 3.937 |
| 2011-09-23 | 5.251 | 3.932 |
| 2011-09-26 | 5.237 | 3.912 |
| 2011-09-27 | 5.385 | 3.915 |
| 2011-09-28 | 5.226 | 3.952 |
| 2011-09-29 | 5.479 | 3.98 |
| 2011-09-30 | 5.407 | 3.978 |
| 2011-10-03 | 5.546 | 4.023 |
| 2011-10-04 | 5.524 | 4.041 |
| 2011-10-05 | 5.891 | 4.198 |
| 2011-10-06 | 5.786 | 4.197 |
| 2011-10-07 | 5.801 | 4.204 |
| 2011-10-10 | 5.766 | 4.213 |
| 2011-10-11 | 5.633 | 4.247 |
| 2011-10-12 | 5.651 | 4.195 |
| 2011-10-13 | 5.685 | 4.202 |
| 2011-10-14 | 5.649 | 4.211 |
| 2011-10-17 | 5.865 | 4.211 |
| 2011-10-18 | 5.676 | 4.194 |
| 2011-10-19 | 5.831 | 4.226 |
| 2011-10-20 | 5.849 | 4.22 |
| 2011-10-21 | 5.846 | 4.216 |
| 2011-10-24 | 5.716 | 4.205 |
| 2011-10-25 | 5.932 | 4.212 |
| 2011-10-26 | 5.836 | 4.211 |
| 2011-10-27 | 5.751 | 4.217 |
| 2011-10-28 | 5.941 | 4.227 |
| 2011-10-31 | 5.765 | 4.247 |
| 2011-11-01 | 5.855 | 4.253 |
| 2011-11-02 | 5.913 | 4.391 |
| 2011-11-03 | 5.915 | 4.404 |
| 2011-11-04 | 6.313 | 4.467 |
| 2011-11-07 | 6.228 | 4.465 |
| 2011-11-08 | 6.15 | 4.482 |
| 2011-11-09 | 6.172 | 4.492 |
| 2011-11-10 | 6.205 | 4.482 |
| 2011-11-11 | 6.205 | 4.492 |
| 2011-11-14 | 6.455 | 4.486 |
| 2011-11-15 | 6.393 | 4.502 |
| 2011-11-16 | 6.25 | 4.481 |
| 2011-11-17 | 6.282 | 4.484 |
| 2011-11-18 | 6.53 | 4.489 |
| 2011-11-21 | 6.279 | 4.484 |
| 2011-11-22 | 6.604 | 4.489 |
| 2011-11-23 | 6.559 | 4.485 |
| 2011-11-24 | 6.648 | 4.485 |
| 2011-11-25 | 6.561 | 4.485 |
| 2011-11-28 | 6.356 | 4.498 |
| 2011-11-29 | 6.41 | 4.494 |
| 2011-11-30 | 6.546 | 4.474 |
| 2011-12-01 | 6.369 | 4.461 |
| 2011-12-02 | 6.424 | 4.463 |
| 2011-12-05 | 6.537 | 4.424 |
| 2011-12-06 | 6.424 | 4.416 |
| 2011-12-07 | 6.323 | 4.415 |
| 2011-12-08 | 6.533 | 4.424 |
| 2011-12-09 | 6.562 | 4.454 |
| 2011-12-12 | 6.568 | 4.47 |
| 2011-12-13 | 6.31 | 4.463 |
| 2011-12-14 | 6.434 | 4.483 |
| 2011-12-15 | 6.395 | 4.483 |
| 2011-12-16 | 6.296 | 4.474 |
| 2011-12-19 | 6.468 | 4.469 |
| 2011-12-20 | 6.361 | 4.476 |
| 2011-12-21 | 6.307 | 4.472 |
| 2011-12-22 | 6.357 | 4.463 |
| 2011-12-23 | 6.495 | 4.474 |
| 2011-12-26 | 6.576 | 4.482 |
| 2011-12-27 | 6.53 | 4.485 |
| 2011-12-28 | 6.502 | 4.537 |
| 2011-12-29 | 6.505 | 4.552 |
| 2011-12-30 | 6.495 | 4.561 |
| 2012-01-02 | 6.641 | 4.557 |
| 2012-01-03 | 6.616 | 4.564 |
| 2012-01-04 | 6.718 | 4.568 |
| 2012-01-05 | 6.611 | 4.604 |
| 2012-01-06 | 6.574 | 4.6 |
| 2012-01-09 | 6.794 | 4.582 |
| 2012-01-10 | 6.621 | 4.6 |
| 2012-01-11 | 6.745 | 4.618 |
| 2012-01-12 | 6.884 | 4.605 |
| 2012-01-13 | 6.781 | 4.612 |
| 2012-01-16 | 6.806 | 4.611 |
| 2012-01-17 | 6.832 | 4.58 |
| 2012-01-18 | 6.66 | 4.572 |
| 2012-01-19 | 6.736 | 4.554 |
| 2012-01-20 | 6.806 | 4.528 |
| 2012-01-23 | 6.907 | 4.527 |
| 2012-01-24 | 6.567 | 4.533 |
| 2012-01-25 | 6.867 | 4.529 |
| 2012-01-26 | 6.701 | 4.527 |
| 2012-01-27 | 6.829 | 4.53 |
| 2012-01-30 | 6.663 | 4.525 |
| 2012-01-31 | 6.578 | 4.528 |
| 2012-02-01 | 6.578 | 4.521 |
| 2012-02-02 | 6.704 | 4.522 |
| 2012-02-03 | 6.633 | 4.52 |
| 2012-02-06 | 6.645 | 4.514 |
| 2012-02-07 | 6.77 | 4.501 |
| 2012-02-08 | 6.474 | 4.474 |
| 2012-02-09 | 6.628 | 4.475 |
| 2012-02-10 | 6.551 | 4.508 |
| 2012-02-13 | 6.629 | 4.502 |
| 2012-02-14 | 6.772 | 4.492 |
| 2012-02-15 | 6.634 | 4.503 |
| 2012-02-16 | 6.601 | 4.497 |
| 2012-02-17 | 6.755 | 4.508 |
| 2012-02-20 | 6.626 | 4.509 |
| 2012-02-21 | 6.62 | 4.535 |
| 2012-02-22 | 6.7 | 4.536 |
| 2012-02-23 | 6.554 | 4.542 |
| 2012-02-24 | 6.579 | 4.538 |
| 2012-02-27 | 6.552 | 4.536 |
| 2012-02-28 | 6.738 | 4.549 |
| 2012-02-29 | 6.693 | 4.555 |
| 2012-03-01 | 6.796 | 4.545 |
| 2012-03-02 | 6.558 | 4.552 |
| 2012-03-05 | 6.735 | 4.542 |
| 2012-03-06 | 6.858 | 4.546 |
| 2012-03-07 | 6.617 | 4.535 |
| 2012-03-08 | 6.529 | 4.536 |
| 2012-03-09 | 6.821 | 4.552 |
| 2012-03-12 | 6.562 | 4.556 |
| 2012-03-13 | 6.823 | 4.547 |
| 2012-03-14 | 6.903 | 4.551 |
| 2012-03-15 | 6.863 | 4.551 |
| 2012-03-16 | 6.719 | 4.559 |
| 2012-03-19 | 6.609 | 4.563 |
| 2012-03-20 | 6.608 | 4.571 |
| 2012-03-21 | 6.728 | 4.611 |
| 2012-03-22 | 6.694 | 4.604 |
| 2012-03-23 | 6.882 | 4.598 |
| 2012-03-26 | 6.7 | 4.661 |
| 2012-03-27 | 6.96 | 4.662 |
| 2012-03-28 | 6.923 | 4.646 |
| 2012-03-29 | 6.95 | 4.639 |
| 2012-03-30 | 6.718 | 4.625 |
| 2012-04-02 | 6.795 | 4.662 |
| 2012-04-03 | 6.878 | 4.667 |
| 2012-04-04 | 6.95 | 4.676 |
| 2012-04-05 | 7.002 | 4.671 |
| 2012-04-06 | 6.766 | 4.698 |
| 2012-04-09 | 6.901 | 4.689 |
| 2012-04-10 | 7.045 | 4.684 |
| 2012-04-11 | 6.879 | 4.684 |
| 2012-04-12 | 6.874 | 4.669 |
| 2012-04-13 | 6.865 | 4.671 |
| 2012-04-16 | 6.857 | 4.674 |
| 2012-04-17 | 7.081 | 4.673 |
| 2012-04-18 | 6.852 | 4.677 |
| 2012-04-19 | 6.987 | 4.673 |
| 2012-04-20 | 6.904 | 4.658 |
| 2012-04-23 | 6.904 | 4.684 |
| 2012-04-24 | 7.048 | 4.674 |
| 2012-04-25 | 6.954 | 4.683 |
| 2012-04-26 | 6.83 | 4.682 |
| 2012-04-27 | 6.968 | 4.685 |
| 2012-04-30 | 6.878 | 4.682 |
| 2012-05-01 | 6.812 | 4.687 |
| 2012-05-02 | 7.132 | 4.685 |
| 2012-05-03 | 6.948 | 4.692 |
| 2012-05-04 | 7.019 | 4.697 |
| 2012-05-07 | 7.023 | 4.701 |
| 2012-05-08 | 7.007 | 4.706 |
| 2012-05-09 | 6.801 | 4.701 |
| 2012-05-10 | 6.94 | 4.74 |
| 2012-05-11 | 6.938 | 4.737 |
| 2012-05-14 | 7.166 | 4.755 |
| 2012-05-15 | 6.974 | 4.754 |
| 2012-05-16 | 6.907 | 4.738 |
| 2012-05-17 | 7.208 | 4.741 |
| 2012-05-18 | 7.137 | 4.736 |
| 2012-05-21 | 6.958 | 4.74 |
| 2012-05-22 | 7.103 | 4.797 |
| 2012-05-23 | 7.342 | 4.797 |
| 2012-05-24 | 7.281 | 4.797 |
| 2012-05-25 | 7.154 | 4.792 |
| 2012-05-28 | 7.208 | 4.796 |
| 2012-05-29 | 7.131 | 4.803 |
| 2012-05-30 | 7.347 | 4.801 |
| 2012-05-31 | 7.222 | 4.763 |
| 2012-06-01 | 7.246 | 4.764 |
| 2012-06-04 | 7.625 | 4.757 |
| 2012-06-05 | 7.472 | 4.761 |
| 2012-06-06 | 7.517 | 4.761 |
| 2012-06-07 | 7.603 | 4.756 |
| 2012-06-08 | 7.349 | 4.727 |
| 2012-06-11 | 7.54 | 4.728 |
| 2012-06-12 | 7.71 | 4.727 |
| 2012-06-13 | 7.582 | 4.762 |
| 2012-06-14 | 7.297 | 4.749 |
| 2012-06-15 | 7.328 | 4.721 |
| 2012-06-18 | 7.497 | 4.744 |
| 2012-06-19 | 7.26 | 4.748 |
| 2012-06-20 | 7.218 | 4.742 |
| 2012-06-21 | 7.363 | 4.786 |
| 2012-06-22 | 7.272 | 4.787 |
| 2012-06-25 | 6.98 | 4.79 |
| 2012-06-26 | 7.166 | 4.769 |
| 2012-06-27 | 7.408 | 4.78 |
| 2012-06-28 | 7.334 | 4.781 |
| 2012-06-29 | 7.126 | 4.79 |
| 2012-07-02 | 7.07 | 4.798 |
| 2012-07-03 | 7.057 | 4.794 |
| 2012-07-04 | 7.318 | 4.789 |
| 2012-07-05 | 7.382 | 4.794 |
| 2012-07-06 | 7.154 | 4.798 |
| 2012-07-09 | 7.128 | 4.742 |
| 2012-07-10 | 7.27 | 4.745 |
| 2012-07-11 | 7.122 | 4.749 |
| 2012-07-12 | 7.292 | 4.784 |
| 2012-07-13 | 7.127 | 4.782 |
| 2012-07-16 | 7.247 | 4.781 |
| 2012-07-17 | 7.066 | 4.79 |
| 2012-07-18 | 7.447 | 4.857 |
| 2012-07-19 | 7.423 | 4.865 |
| 2012-07-20 | 7.391 | 4.858 |
| 2012-07-23 | 7.227 | 4.836 |
| 2012-07-24 | 7.005 | 4.834 |
| 2012-07-25 | 7.436 | 4.877 |
| 2012-07-26 | 7.162 | 4.92 |
| 2012-07-27 | 7.195 | 4.923 |
| 2012-07-30 | 7.137 | 4.907 |
| 2012-07-31 | 7.388 | 4.91 |
| 2012-08-01 | 7.343 | 4.91 |
| 2012-08-02 | 7.144 | 4.966 |
| 2012-08-03 | 7.197 | 4.973 |
| 2012-08-06 | 7.173 | 4.969 |
| 2012-08-07 | 7.163 | 4.986 |
| 2012-08-08 | 7.435 | 4.989 |
| 2012-08-09 | 7.348 | 4.994 |
| 2012-08-10 | 7.169 | 5.024 |
| 2012-08-13 | 7.509 | 5.023 |
| 2012-08-14 | 7.5 | 5.168 |
| 2012-08-15 | 7.528 | 5.15 |
| 2012-08-16 | 7.429 | 5.216 |
| 2012-08-17 | 7.467 | 5.21 |
| 2012-08-20 | 7.564 | 5.21 |
| 2012-08-21 | 7.669 | 5.215 |
| 2012-08-22 | 7.37 | 5.219 |
| 2012-08-23 | 7.325 | 5.231 |
| 2012-08-24 | 7.448 | 5.228 |
| 2012-08-27 | 7.667 | 5.256 |
| 2012-08-28 | 7.502 | 5.238 |
| 2012-08-29 | 7.535 | 5.239 |
| 2012-08-30 | 7.375 | 5.234 |
| 2012-08-31 | 7.42 | 5.227 |
| 2012-09-03 | 7.393 | 5.225 |
| 2012-09-04 | 7.35 | 5.218 |
| 2012-09-05 | 7.46 | 5.203 |
| 2012-09-06 | 7.709 | 5.222 |
| 2012-09-07 | 7.318 | 5.163 |
| 2012-09-10 | 7.554 | 5.2 |
| 2012-09-11 | 7.401 | 5.25 |
| 2012-09-12 | 7.593 | 5.245 |
| 2012-09-13 | 7.379 | 5.28 |
| 2012-09-14 | 7.341 | 5.286 |
| 2012-09-17 | 7.636 | 5.293 |
| 2012-09-18 | 7.398 | 5.284 |
| 2012-09-19 | 7.542 | 5.289 |
| 2012-09-20 | 7.568 | 5.269 |
| 2012-09-21 | 7.378 | 5.27 |
| 2012-09-24 | 7.431 | 5.265 |
| 2012-09-25 | 7.439 | 5.257 |
| 2012-09-26 | 7.645 | 5.255 |
| 2012-09-27 | 7.271 | 5.207 |
| 2012-09-28 | 7.563 | 5.214 |
| 2012-10-01 | 7.637 | 5.316 |
| 2012-10-02 | 7.435 | 5.313 |
| 2012-10-03 | 7.393 | 5.32 |
| 2012-10-04 | 7.562 | 5.326 |
| 2012-10-05 | 7.546 | 5.354 |
| 2012-10-08 | 7.539 | 5.352 |
| 2012-10-09 | 7.285 | 5.335 |
| 2012-10-10 | 7.38 | 5.352 |
| 2012-10-11 | 7.713 | 5.418 |
| 2012-10-12 | 7.434 | 5.425 |
| 2012-10-15 | 7.358 | 5.424 |
| 2012-10-16 | 7.688 | 5.425 |
| 2012-10-17 | 7.775 | 5.433 |
| 2012-10-18 | 7.737 | 5.445 |
| 2012-10-19 | 7.655 | 5.45 |
| 2012-10-22 | 7.538 | 5.463 |
| 2012-10-23 | 7.456 | 5.466 |
| 2012-10-24 | 7.369 | 5.476 |
| 2012-10-25 | 7.726 | 5.483 |
| 2012-10-26 | 7.398 | 5.464 |
| 2012-10-29 | 7.68 | 5.464 |
| 2012-10-30 | 7.767 | 5.486 |
| 2012-10-31 | 7.525 | 5.491 |
| 2012-11-01 | 7.599 | 5.483 |
| 2012-11-02 | 7.488 | 5.478 |
| 2012-11-05 | 7.662 | 5.517 |
| 2012-11-06 | 7.484 | 5.512 |
| 2012-11-07 | 7.816 | 5.527 |
| 2012-11-08 | 7.69 | 5.501 |
| 2012-11-09 | 7.82 | 5.51 |
| 2012-11-12 | 7.681 | 5.499 |
| 2012-11-13 | 7.525 | 5.494 |
| 2012-11-14 | 7.643 | 5.497 |
| 2012-11-15 | 7.701 | 5.487 |
| 2012-11-16 | 7.627 | 5.499 |
| 2012-11-19 | 7.837 | 5.557 |
| 2012-11-20 | 7.705 | 5.618 |
| 2012-11-21 | 7.942 | 5.604 |
| 2012-11-22 | 8.029 | 5.609 |
| 2012-11-23 | 7.973 | 5.599 |
| 2012-11-26 | 7.735 | 5.596 |
| 2012-11-27 | 7.837 | 5.6 |
| 2012-11-28 | 8.066 | 5.602 |
| 2012-11-29 | 7.889 | 5.6 |
| 2012-11-30 | 7.86 | 5.614 |
| 2012-12-03 | 7.999 | 5.606 |
| 2012-12-04 | 7.943 | 5.621 |
| 2012-12-05 | 7.893 | 5.49 |
| 2012-12-06 | 7.752 | 5.486 |
| 2012-12-07 | 7.908 | 5.413 |
| 2012-12-10 | 8.036 | 5.409 |
| 2012-12-11 | 8.001 | 5.404 |
| 2012-12-12 | 7.852 | 5.405 |
| 2012-12-13 | 7.948 | 5.383 |
| 2012-12-14 | 7.681 | 5.013 |
| 2012-12-17 | 7.716 | 5.016 |
| 2012-12-18 | 7.508 | 5.016 |
| 2012-12-19 | 7.615 | 5.028 |
| 2012-12-20 | 7.419 | 5.016 |
| 2012-12-21 | 7.415 | 5.01 |
| 2012-12-24 | 7.645 | 5.004 |
| 2012-12-25 | 7.531 | 4.932 |
| 2012-12-26 | 7.553 | 4.935 |
| 2012-12-27 | 7.296 | 4.962 |
| 2012-12-28 | 7.401 | 4.955 |
| 2012-12-31 | 7.45 | 4.898 |
| 2013-01-01 | 7.391 | 4.906 |
| 2013-01-02 | 7.199 | 4.91 |
| 2013-01-03 | 7.286 | 4.91 |
| 2013-01-04 | 7.136 | 4.93 |
| 2013-01-07 | 7.198 | 4.925 |
| 2013-01-08 | 7.405 | 4.929 |
| 2013-01-09 | 7.222 | 4.955 |
| 2013-01-10 | 7.2 | 4.953 |
| 2013-01-11 | 7.162 | 4.923 |
| 2013-01-14 | 7.288 | 4.769 |
| 2013-01-15 | 7.326 | 4.767 |
| 2013-01-16 | 7.024 | 4.754 |
| 2013-01-17 | 7.2 | 4.76 |
| 2013-01-18 | 7.038 | 4.729 |
| 2013-01-21 | 7.012 | 4.716 |
| 2013-01-22 | 7.322 | 4.727 |
| 2013-01-23 | 7.403 | 4.714 |
| 2013-01-24 | 7.119 | 4.713 |
| 2013-01-25 | 7.337 | 4.726 |
| 2013-01-28 | 7.082 | 4.637 |
| 2013-01-29 | 7.276 | 4.629 |
| 2013-01-30 | 7.079 | 4.632 |
| 2013-01-31 | 7.092 | 4.621 |
| 2013-02-01 | 6.886 | 4.545 |
| 2013-02-04 | 7.035 | 4.541 |
| 2013-02-05 | 6.78 | 4.515 |
| 2013-02-06 | 6.869 | 4.508 |
| 2013-02-07 | 6.792 | 4.446 |
| 2013-02-08 | 6.865 | 4.436 |
| 2013-02-11 | 6.937 | 4.433 |
| 2013-02-12 | 6.85 | 4.435 |
| 2013-02-13 | 6.965 | 4.445 |
| 2013-02-14 | 6.981 | 4.445 |
| 2013-02-15 | 6.868 | 4.456 |
| 2013-02-18 | 6.92 | 4.459 |
| 2013-02-19 | 6.915 | 4.446 |
| 2013-02-20 | 6.954 | 4.444 |
| 2013-02-21 | 6.919 | 4.357 |
| 2013-02-22 | 6.608 | 4.355 |
| 2013-02-25 | 6.874 | 4.353 |
| 2013-02-26 | 6.694 | 4.354 |
| 2013-02-27 | 6.829 | 4.343 |
| 2013-02-28 | 6.584 | 4.283 |
| 2013-03-01 | 6.82 | 4.273 |
| 2013-03-04 | 6.594 | 4.139 |
| 2013-03-05 | 6.57 | 4.005 |
| 2013-03-06 | 6.577 | 4.003 |
| 2013-03-07 | 6.392 | 3.976 |
| 2013-03-08 | 6.401 | 3.979 |
| 2013-03-11 | 6.451 | 3.97 |
| 2013-03-12 | 6.518 | 3.962 |
| 2013-03-13 | 6.542 | 3.956 |
| 2013-03-14 | 6.398 | 3.957 |
| 2013-03-15 | 6.444 | 3.954 |
| 2013-03-18 | 6.339 | 3.955 |
| 2013-03-19 | 6.234 | 3.956 |
| 2013-03-20 | 6.302 | 3.856 |
| 2013-03-21 | 6.292 | 3.847 |
| 2013-03-22 | 6.241 | 3.845 |
| 2013-03-25 | 6.426 | 3.845 |
| 2013-03-26 | 6.266 | 3.83 |
| 2013-03-27 | 6.289 | 3.824 |
| 2013-03-28 | 6.232 | 3.716 |
| 2013-03-29 | 6.056 | 3.711 |
| 2013-04-01 | 6.074 | 3.706 |
| 2013-04-02 | 6.327 | 3.718 |
| 2013-04-03 | 6.086 | 3.713 |
| 2013-04-04 | 6.037 | 3.716 |
| 2013-04-05 | 6.186 | 3.719 |
| 2013-04-08 | 6.085 | 3.723 |
| 2013-04-09 | 6.338 | 3.726 |
| 2013-04-10 | 6.247 | 3.726 |
| 2013-04-11 | 6.325 | 3.726 |
| 2013-04-12 | 6.341 | 3.736 |
| 2013-04-15 | 6.384 | 3.734 |
| 2013-04-16 | 6.144 | 3.73 |
| 2013-04-17 | 6.305 | 3.724 |
| 2013-04-18 | 6.292 | 3.727 |
| 2013-04-19 | 6.261 | 3.678 |
| 2013-04-22 | 6.286 | 3.684 |
| 2013-04-23 | 6.184 | 3.653 |
| 2013-04-24 | 6.201 | 3.646 |
| 2013-04-25 | 6.141 | 3.647 |
| 2013-04-26 | 6.128 | 3.644 |
| 2013-04-29 | 6.255 | 3.646 |
| 2013-04-30 | 6.2 | 3.65 |
| 2013-05-01 | 6.27 | 3.651 |
| 2013-05-02 | 6.319 | 3.653 |
| 2013-05-03 | 6.177 | 3.645 |
| 2013-05-06 | 6.055 | 3.647 |
| 2013-05-07 | 6.2 | 3.65 |
| 2013-05-08 | 6.351 | 3.66 |
| 2013-05-09 | 6.224 | 3.658 |
| 2013-05-10 | 6.299 | 3.654 |
| 2013-05-13 | 6.116 | 3.649 |
| 2013-05-14 | 6.147 | 3.653 |
| 2013-05-15 | 6.093 | 3.651 |
| 2013-05-16 | 6.296 | 3.641 |
| 2013-05-17 | 6.178 | 3.641 |
| 2013-05-20 | 6.275 | 3.637 |
| 2013-05-21 | 6.076 | 3.654 |
| 2013-05-22 | 6.093 | 3.649 |
| 2013-05-23 | 6.096 | 3.66 |
| 2013-05-24 | 6.181 | 3.656 |
| 2013-05-27 | 6.171 | 3.654 |
| 2013-05-28 | 6.328 | 3.649 |
| 2013-05-29 | 6.122 | 3.663 |
| 2013-05-30 | 6.288 | 3.662 |
| 2013-05-31 | 6.195 | 3.663 |
| 2013-06-03 | 6.286 | 3.655 |
| 2013-06-04 | 6.428 | 3.659 |
| 2013-06-05 | 6.39 | 3.666 |
| 2013-06-06 | 6.503 | 3.655 |
| 2013-06-07 | 6.321 | 3.653 |
| 2013-06-10 | 6.503 | 3.657 |
| 2013-06-11 | 6.422 | 3.661 |
| 2013-06-12 | 6.483 | 3.657 |
| 2013-06-13 | 6.701 | 3.636 |
| 2013-06-14 | 6.463 | 3.64 |
| 2013-06-17 | 6.54 | 3.636 |
| 2013-06-18 | 6.534 | 3.638 |
| 2013-06-19 | 6.333 | 3.639 |
| 2013-06-20 | 6.195 | 3.599 |
| 2013-06-21 | 6.256 | 3.596 |
| 2013-06-24 | 6.096 | 3.481 |
| 2013-06-25 | 5.913 | 3.479 |
| 2013-06-26 | 5.849 | 3.476 |
| 2013-06-27 | 5.965 | 3.491 |
| 2013-06-28 | 5.683 | 3.46 |
| 2013-07-01 | 5.655 | 3.463 |
| 2013-07-02 | 5.654 | 3.461 |
| 2013-07-03 | 5.624 | 3.452 |
| 2013-07-04 | 5.758 | 3.447 |
| 2013-07-05 | 5.672 | 3.447 |
| 2013-07-08 | 5.691 | 3.442 |
| 2013-07-09 | 5.632 | 3.446 |
| 2013-07-10 | 5.561 | 3.442 |
| 2013-07-11 | 5.59 | 3.365 |
| 2013-07-12 | 5.656 | 3.343 |
| 2013-07-15 | 5.71 | 3.336 |
| 2013-07-16 | 5.688 | 3.341 |
| 2013-07-17 | 5.692 | 3.338 |
| 2013-07-18 | 5.732 | 3.326 |
| 2013-07-19 | 5.741 | 3.325 |
| 2013-07-22 | 5.789 | 3.321 |
| 2013-07-23 | 5.734 | 3.31 |
| 2013-07-24 | 5.745 | 3.3 |
| 2013-07-25 | 5.526 | 3.3 |
| 2013-07-26 | 5.697 | 3.298 |
| 2013-07-29 | 5.556 | 3.29 |
| 2013-07-30 | 5.79 | 3.287 |
| 2013-07-31 | 5.687 | 3.291 |
| 2013-08-01 | 5.77 | 3.277 |
| 2013-08-02 | 5.666 | 3.277 |
| 2013-08-05 | 5.798 | 3.284 |
| 2013-08-06 | 5.633 | 3.284 |
| 2013-08-07 | 5.519 | 3.283 |
| 2013-08-08 | 5.598 | 3.282 |
| 2013-08-09 | 5.589 | 3.29 |
| 2013-08-12 | 5.54 | 3.265 |
| 2013-08-13 | 5.656 | 3.264 |
| 2013-08-14 | 5.528 | 3.263 |
| 2013-08-15 | 5.691 | 3.266 |
| 2013-08-16 | 5.528 | 3.266 |
| 2013-08-19 | 5.717 | 3.259 |
| 2013-08-20 | 5.654 | 3.261 |
| 2013-08-21 | 5.606 | 3.263 |
| 2013-08-22 | 5.698 | 3.27 |
| 2013-08-23 | 5.529 | 3.263 |
| 2013-08-26 | 5.646 | 3.263 |
| 2013-08-27 | 5.579 | 3.262 |
| 2013-08-28 | 5.646 | 3.287 |
| 2013-08-29 | 5.786 | 3.283 |
| 2013-08-30 | 5.756 | 3.284 |
| 2013-09-02 | 5.846 | 3.286 |
| 2013-09-03 | 5.833 | 3.276 |
| 2013-09-04 | 5.712 | 3.279 |
| 2013-09-05 | 5.806 | 3.283 |
| 2013-09-06 | 5.736 | 3.27 |
| 2013-09-09 | 5.276 | 3.12 |
| 2013-09-10 | 5.35 | 3.116 |
| 2013-09-11 | 5.431 | 3.117 |
| 2013-09-12 | 5.266 | 3.088 |
| 2013-09-13 | 5.253 | 3.089 |
| 2013-09-16 | 5.285 | 3.076 |
| 2013-09-17 | 5.324 | 3.07 |
| 2013-09-18 | 5.208 | 3.071 |
| 2013-09-19 | 5.294 | 3.073 |
| 2013-09-20 | 5.407 | 3.071 |
| 2013-09-23 | 5.226 | 3.072 |
| 2013-09-24 | 5.292 | 3.054 |
| 2013-09-25 | 5.284 | 3.053 |
| 2013-09-26 | 5.44 | 3.046 |
| 2013-09-27 | 5.203 | 3.051 |
| 2013-09-30 | 5.444 | 3.047 |
| 2013-10-01 | 5.325 | 3.046 |
| 2013-10-02 | 5.258 | 3.05 |
| 2013-10-03 | 5.258 | 3.049 |
| 2013-10-04 | 5.279 | 3.048 |
| 2013-10-07 | 5.342 | 3.047 |
| 2013-10-08 | 5.424 | 3.049 |
| 2013-10-09 | 5.31 | 3.049 |
| 2013-10-10 | 5.397 | 3.044 |
| 2013-10-11 | 5.397 | 3.033 |
| 2013-10-14 | 5.457 | 3.033 |
| 2013-10-15 | 5.184 | 3.033 |
| 2013-10-16 | 5.435 | 3.033 |
| 2013-10-17 | 5.422 | 3.037 |
| 2013-10-18 | 5.38 | 3.037 |
| 2013-10-21 | 5.48 | 3.031 |
| 2013-10-22 | 5.474 | 3.035 |
| 2013-10-23 | 5.333 | 3.037 |
| 2013-10-24 | 5.222 | 3.035 |
| 2013-10-25 | 5.24 | 3.036 |
| 2013-10-28 | 5.333 | 3.033 |
| 2013-10-29 | 5.382 | 3.03 |
| 2013-10-30 | 5.389 | 3.026 |
| 2013-10-31 | 5.386 | 3.019 |
| 2013-11-01 | 5.382 | 3.026 |
| 2013-11-04 | 5.189 | 3.024 |
| 2013-11-05 | 5.394 | 3.022 |
| 2013-11-06 | 5.265 | 3.017 |
| 2013-11-07 | 5.303 | 3.016 |
| 2013-11-08 | 5.44 | 3.018 |
| 2013-11-11 | 5.451 | 3.022 |
| 2013-11-12 | 5.248 | 3.017 |
| 2013-11-13 | 5.315 | 3.005 |
| 2013-11-14 | 5.453 | 3.005 |
| 2013-11-15 | 5.217 | 2.999 |
| 2013-11-18 | 5.217 | 2.966 |
| 2013-11-19 | 5.262 | 2.968 |
| 2013-11-20 | 5.22 | 2.966 |
| 2013-11-21 | 5.363 | 2.966 |
| 2013-11-22 | 5.457 | 2.969 |
| 2013-11-25 | 5.298 | 2.99 |
| 2013-11-26 | 5.244 | 2.988 |
| 2013-11-27 | 5.439 | 3.001 |
| 2013-11-28 | 5.242 | 3.005 |
| 2013-11-29 | 5.218 | 3.005 |
| 2013-12-02 | 5.223 | 3.004 |
| 2013-12-03 | 5.33 | 2.998 |
| 2013-12-04 | 5.365 | 3.081 |
| 2013-12-05 | 5.501 | 3.081 |
| 2013-12-06 | 5.463 | 3.082 |
| 2013-12-09 | 5.289 | 3.079 |
| 2013-12-10 | 5.386 | 3.08 |
| 2013-12-11 | 5.382 | 3.076 |
| 2013-12-12 | 5.495 | 3.084 |
| 2013-12-13 | 5.579 | 3.108 |
| 2013-12-16 | 5.451 | 3.104 |
| 2013-12-17 | 5.499 | 3.106 |
| 2013-12-18 | 5.413 | 3.11 |
| 2013-12-19 | 5.474 | 3.126 |
| 2013-12-20 | 5.533 | 3.089 |
| 2013-12-23 | 5.308 | 3.082 |
| 2013-12-24 | 5.383 | 3.082 |
| 2013-12-25 | 5.367 | 3.087 |
| 2013-12-26 | 5.565 | 3.088 |
| 2013-12-27 | 5.491 | 3.087 |
| 2013-12-30 | 5.282 | 3.083 |
| 2013-12-31 | 5.326 | 3.083 |
| 2014-01-01 | 5.489 | 3.084 |
| 2014-01-02 | 5.327 | 3.119 |
| 2014-01-03 | 5.603 | 3.118 |
| 2014-01-06 | 5.399 | 3.123 |
| 2014-01-07 | 5.407 | 3.118 |
| 2014-01-08 | 5.415 | 3.132 |
| 2014-01-09 | 5.374 | 3.131 |
| 2014-01-10 | 5.335 | 3.146 |
| 2014-01-13 | 5.389 | 3.154 |
| 2014-01-14 | 5.375 | 3.157 |
| 2014-01-15 | 5.395 | 3.151 |
| 2014-01-16 | 5.42 | 3.191 |
| 2014-01-17 | 5.538 | 3.192 |
| 2014-01-20 | 5.579 | 3.195 |
| 2014-01-21 | 5.666 | 3.198 |
| 2014-01-22 | 5.724 | 3.219 |
| 2014-01-23 | 5.791 | 3.226 |
| 2014-01-24 | 5.547 | 3.229 |
| 2014-01-27 | 5.595 | 3.232 |
| 2014-01-28 | 5.809 | 3.248 |
| 2014-01-29 | 5.506 | 3.253 |
| 2014-01-30 | 5.648 | 3.25 |
| 2014-01-31 | 5.79 | 3.245 |
| 2014-02-03 | 5.648 | 3.248 |
| 2014-02-04 | 5.807 | 3.248 |
| 2014-02-05 | 5.612 | 3.246 |
| 2014-02-06 | 5.78 | 3.25 |
| 2014-02-07 | 5.635 | 3.254 |
| 2014-02-10 | 5.688 | 3.247 |
| 2014-02-11 | 5.583 | 3.258 |
| 2014-02-12 | 5.581 | 3.255 |
| 2014-02-13 | 5.666 | 3.24 |
| 2014-02-14 | 5.831 | 3.244 |
| 2014-02-17 | 5.793 | 3.245 |
| 2014-02-18 | 5.723 | 3.267 |
| 2014-02-19 | 5.861 | 3.237 |
| 2014-02-20 | 5.839 | 3.298 |
| 2014-02-21 | 5.918 | 3.373 |
| 2014-02-24 | 5.644 | 3.364 |
| 2014-02-25 | 5.88 | 3.375 |
| 2014-02-26 | 5.827 | 3.382 |
| 2014-02-27 | 5.878 | 3.374 |
| 2014-02-28 | 5.877 | 3.382 |
| 2014-03-03 | 5.982 | 3.384 |
| 2014-03-04 | 5.801 | 3.386 |
| 2014-03-05 | 5.716 | 3.378 |
| 2014-03-06 | 5.801 | 3.385 |
| 2014-03-07 | 5.818 | 3.39 |
| 2014-03-10 | 6.054 | 3.445 |
| 2014-03-11 | 5.817 | 3.442 |
| 2014-03-12 | 5.829 | 3.427 |
| 2014-03-13 | 6.054 | 3.426 |
| 2014-03-14 | 5.996 | 3.428 |
| 2014-03-17 | 5.963 | 3.421 |
| 2014-03-18 | 6.044 | 3.502 |
| 2014-03-19 | 6.025 | 3.511 |
| 2014-03-20 | 6.035 | 3.515 |
| 2014-03-21 | 5.975 | 3.458 |
| 2014-03-24 | 6.015 | 3.457 |
| 2014-03-25 | 6.098 | 3.452 |
| 2014-03-26 | 5.82 | 3.45 |
| 2014-03-27 | 5.929 | 3.454 |
| 2014-03-28 | 6.002 | 3.456 |
| 2014-03-31 | 5.794 | 3.45 |
| 2014-04-01 | 5.96 | 3.45 |
| 2014-04-02 | 5.829 | 3.447 |
| 2014-04-03 | 6.024 | 3.442 |
| 2014-04-04 | 5.92 | 3.442 |
| 2014-04-07 | 5.86 | 3.444 |
| 2014-04-08 | 5.786 | 3.42 |
| 2014-04-09 | 5.786 | 3.46 |
| 2014-04-10 | 5.745 | 3.454 |
| 2014-04-11 | 5.783 | 3.473 |
| 2014-04-14 | 5.846 | 3.481 |
| 2014-04-15 | 5.922 | 3.473 |
| 2014-04-16 | 6.014 | 3.473 |
| 2014-04-17 | 5.823 | 3.471 |
| 2014-04-18 | 5.998 | 3.471 |
| 2014-04-21 | 5.866 | 3.463 |
| 2014-04-22 | 5.747 | 3.459 |
| 2014-04-23 | 5.999 | 3.468 |
| 2014-04-24 | 5.937 | 3.472 |
| 2014-04-25 | 5.923 | 3.473 |
| 2014-04-28 | 5.719 | 3.462 |
| 2014-04-29 | 5.98 | 3.471 |
| 2014-04-30 | 5.88 | 3.475 |
| 2014-05-01 | 5.958 | 3.48 |
| 2014-05-02 | 5.803 | 3.485 |
| 2014-05-05 | 5.95 | 3.484 |
| 2014-05-06 | 5.892 | 3.49 |
| 2014-05-07 | 5.792 | 3.491 |
| 2014-05-08 | 5.747 | 3.497 |
| 2014-05-09 | 5.852 | 3.498 |
| 2014-05-12 | 5.842 | 3.498 |
| 2014-05-13 | 5.75 | 3.509 |
| 2014-05-14 | 5.735 | 3.513 |
| 2014-05-15 | 5.977 | 3.509 |
| 2014-05-16 | 5.894 | 3.518 |
| 2014-05-19 | 6.051 | 3.514 |
| 2014-05-20 | 5.827 | 3.515 |
| 2014-05-21 | 5.959 | 3.517 |
| 2014-05-22 | 5.954 | 3.523 |
| 2014-05-23 | 5.75 | 3.514 |
| 2014-05-26 | 5.901 | 3.523 |
| 2014-05-27 | 5.939 | 3.529 |
| 2014-05-28 | 5.756 | 3.528 |
| 2014-05-29 | 5.95 | 3.529 |
| 2014-05-30 | 5.972 | 3.534 |
| 2014-06-02 | 5.792 | 3.529 |
| 2014-06-03 | 6.028 | 3.557 |
| 2014-06-04 | 5.779 | 3.561 |
| 2014-06-05 | 5.747 | 3.555 |
| 2014-06-06 | 5.877 | 3.551 |
| 2014-06-09 | 5.86 | 3.559 |
| 2014-06-10 | 6.178 | 3.593 |
| 2014-06-11 | 6.136 | 3.599 |
| 2014-06-12 | 6.519 | 3.73 |
| 2014-06-13 | 6.198 | 3.722 |
| 2014-06-16 | 6.525 | 3.729 |
| 2014-06-17 | 6.66 | 3.731 |
| 2014-06-18 | 6.731 | 3.772 |
| 2014-06-19 | 6.723 | 3.778 |
| 2014-06-20 | 6.437 | 3.78 |
| 2014-06-23 | 6.44 | 3.794 |
| 2014-06-24 | 6.576 | 3.787 |
| 2014-06-25 | 6.429 | 3.787 |
| 2014-06-26 | 6.742 | 3.798 |
| 2014-06-27 | 6.529 | 3.802 |
| 2014-06-30 | 6.253 | 3.803 |
| 2014-07-01 | 6.623 | 3.949 |
| 2014-07-02 | 6.37 | 3.99 |
| 2014-07-03 | 6.285 | 3.995 |
| 2014-07-04 | 6.354 | 3.995 |
| 2014-07-07 | 6.546 | 4.009 |
| 2014-07-08 | 6.351 | 4.028 |
| 2014-07-09 | 6.257 | 4.038 |
| 2014-07-10 | 6.162 | 4.051 |
| 2014-07-11 | 6.154 | 3.999 |
| 2014-07-14 | 6.375 | 4.018 |
| 2014-07-15 | 6.031 | 4.022 |
| 2014-07-16 | 6.201 | 4.024 |
| 2014-07-17 | 6.236 | 4.016 |
| 2014-07-18 | 6.129 | 4.016 |
| 2014-07-21 | 6.165 | 4.018 |
| 2014-07-22 | 6.373 | 4.027 |
| 2014-07-23 | 6.342 | 4.03 |
| 2014-07-24 | 6.042 | 3.994 |
| 2014-07-25 | 6.35 | 3.993 |
| 2014-07-28 | 6.221 | 3.84 |
| 2014-07-29 | 6.104 | 3.812 |
| 2014-07-30 | 6.143 | 3.809 |
| 2014-07-31 | 6.192 | 3.833 |
| 2014-08-01 | 6.076 | 3.831 |
| 2014-08-04 | 6.059 | 3.816 |
| 2014-08-05 | 6.036 | 3.819 |
| 2014-08-06 | 5.947 | 3.817 |
| 2014-08-07 | 6.121 | 3.816 |
| 2014-08-08 | 5.927 | 3.82 |
| 2014-08-11 | 6.18 | 3.816 |
| 2014-08-12 | 5.996 | 3.812 |
| 2014-08-13 | 5.898 | 3.819 |
| 2014-08-14 | 6.114 | 3.827 |
| 2014-08-15 | 6.13 | 3.831 |
| 2014-08-18 | 5.92 | 3.831 |
| 2014-08-19 | 6.036 | 3.827 |
| 2014-08-20 | 5.904 | 3.828 |
| 2014-08-21 | 5.908 | 3.826 |
| 2014-08-22 | 6.133 | 3.837 |
| 2014-08-25 | 5.929 | 3.837 |
| 2014-08-26 | 6.209 | 3.838 |
| 2014-08-27 | 6.236 | 3.85 |
| 2014-08-28 | 6.564 | 4.094 |
| 2014-08-29 | 6.628 | 4.107 |
| 2014-09-01 | 6.503 | 4.105 |
| 2014-09-02 | 6.74 | 4.153 |
| 2014-09-03 | 6.57 | 4.16 |
| 2014-09-04 | 6.667 | 4.18 |
| 2014-09-05 | 6.602 | 4.223 |
| 2014-09-08 | 6.654 | 4.226 |
| 2014-09-09 | 6.704 | 4.22 |
| 2014-09-10 | 6.764 | 4.214 |
| 2014-09-11 | 6.803 | 4.216 |
| 2014-09-12 | 6.615 | 4.257 |
| 2014-09-15 | 6.755 | 4.255 |
| 2014-09-16 | 6.697 | 4.28 |
| 2014-09-17 | 6.776 | 4.28 |
| 2014-09-18 | 6.629 | 4.285 |
| 2014-09-19 | 6.675 | 4.278 |
| 2014-09-22 | 6.827 | 4.253 |
| 2014-09-23 | 6.808 | 4.246 |
| 2014-09-24 | 6.556 | 4.242 |
| 2014-09-25 | 6.607 | 4.236 |
| 2014-09-26 | 6.823 | 4.235 |
| 2014-09-29 | 6.646 | 4.237 |
| 2014-09-30 | 6.645 | 4.257 |
| 2014-10-01 | 6.628 | 4.293 |
| 2014-10-02 | 6.711 | 4.297 |
| 2014-10-03 | 6.921 | 4.304 |
| 2014-10-06 | 6.835 | 4.307 |
| 2014-10-07 | 6.801 | 4.316 |
| 2014-10-08 | 6.837 | 4.308 |
| 2014-10-09 | 6.675 | 4.318 |
| 2014-10-10 | 6.558 | 4.32 |
| 2014-10-13 | 6.902 | 4.329 |
| 2014-10-14 | 6.818 | 4.331 |
| 2014-10-15 | 6.769 | 4.334 |
| 2014-10-16 | 6.913 | 4.331 |
| 2014-10-17 | 6.887 | 4.375 |
| 2014-10-20 | 6.649 | 4.375 |
| 2014-10-21 | 6.727 | 4.392 |
| 2014-10-22 | 6.748 | 4.4 |
| 2014-10-23 | 6.704 | 4.4 |
| 2014-10-24 | 6.632 | 4.413 |
| 2014-10-27 | 6.881 | 4.414 |
| 2014-10-28 | 6.578 | 4.403 |
| 2014-10-29 | 6.775 | 4.396 |
| 2014-10-30 | 6.66 | 4.456 |
| 2014-10-31 | 6.761 | 4.388 |
| 2014-11-03 | 6.467 | 4.437 |
| 2014-11-04 | 6.672 | 4.434 |
| 2014-11-05 | 6.483 | 4.443 |
| 2014-11-06 | 6.618 | 4.563 |
| 2014-11-07 | 6.812 | 4.574 |
| 2014-11-10 | 6.58 | 4.54 |
| 2014-11-11 | 6.124 | 4.49 |
| 2014-11-12 | 6.242 | 4.485 |
| 2014-11-13 | 6.078 | 4.485 |
| 2014-11-14 | 6.266 | 4.481 |
| 2014-11-17 | 6.023 | 4.472 |
| 2014-11-18 | 6.109 | 4.452 |
| 2014-11-19 | 6.078 | 4.455 |
| 2014-11-20 | 6.086 | 4.469 |
| 2014-11-21 | 6.166 | 4.453 |
| 2014-11-24 | 6.257 | 4.457 |
| 2014-11-25 | 5.997 | 4.448 |
| 2014-11-26 | 5.9 | 4.4 |
| 2014-11-27 | 6.184 | 4.371 |
| 2014-11-28 | 5.58 | 4.094 |
| 2014-12-01 | 5.711 | 4.096 |
| 2014-12-02 | 5.516 | 3.936 |
| 2014-12-03 | 5.307 | 3.923 |
| 2014-12-04 | 5.177 | 3.8 |
| 2014-12-05 | 4.865 | 3.789 |
| 2014-12-08 | 4.808 | 3.776 |
| 2014-12-09 | 4.341 | 3.599 |
| 2014-12-10 | 4.412 | 3.581 |
| 2014-12-11 | 4.454 | 3.582 |
| 2014-12-12 | 4.334 | 3.576 |
| 2014-12-15 | 4.308 | 3.566 |
| 2014-12-16 | 4.324 | 3.53 |
| 2014-12-17 | 4.255 | 3.437 |
| 2014-12-18 | 4.278 | 3.432 |
| 2014-12-19 | 4.238 | 3.435 |
| 2014-12-22 | 3.896 | 3.4 |
| 2014-12-23 | 3.923 | 3.371 |
| 2014-12-24 | 3.755 | 3.339 |
| 2014-12-25 | 3.802 | 3.304 |
| 2014-12-26 | 3.8 | 3.283 |
| 2014-12-29 | 3.679 | 3.278 |
| 2014-12-30 | 3.77 | 3.253 |
| 2014-12-31 | 3.64 | 3.239 |
| 2015-01-01 | 3.736 | 3.238 |
| 2015-01-02 | 3.628 | 3.238 |
| 2015-01-05 | 3.703 | 3.238 |
| 2015-01-06 | 3.625 | 3.231 |
| 2015-01-07 | 3.607 | 3.231 |
| 2015-01-08 | 3.596 | 3.209 |
| 2015-01-09 | 3.629 | 3.206 |
| 2015-01-12 | 3.522 | 3.207 |
| 2015-01-13 | 3.614 | 3.21 |
| 2015-01-14 | 3.629 | 3.207 |
| 2015-01-15 | 3.493 | 3.189 |
| 2015-01-16 | 3.491 | 3.185 |
| 2015-01-19 | 3.364 | 3.035 |
| 2015-01-20 | 3.374 | 3.031 |
| 2015-01-21 | 3.284 | 3.001 |
| 2015-01-22 | 3.252 | 2.999 |
| 2015-01-23 | 3.298 | 2.999 |
| 2015-01-26 | 3.239 | 2.997 |
| 2015-01-27 | 3.252 | 2.988 |
| 2015-01-28 | 3.28 | 2.984 |
| 2015-01-29 | 3.176 | 2.979 |
| 2015-01-30 | 3.259 | 2.989 |
| 2015-02-02 | 3.195 | 2.984 |
| 2015-02-03 | 3.144 | 2.982 |
| 2015-02-04 | 3.112 | 2.977 |
| 2015-02-05 | 3.142 | 2.979 |
| 2015-02-06 | 3.23 | 2.981 |
| 2015-02-09 | 3.224 | 2.996 |
| 2015-02-10 | 3.117 | 2.999 |
| 2015-02-11 | 3.135 | 3.002 |
| 2015-02-12 | 3.147 | 3.011 |
| 2015-02-13 | 3.096 | 3.015 |
| 2015-02-16 | 3.122 | 3.016 |
| 2015-02-17 | 3.152 | 3.022 |
| 2015-02-18 | 3.163 | 3.02 |
| 2015-02-19 | 3.166 | 3.023 |
| 2015-02-20 | 3.135 | 3.025 |
| 2015-02-23 | 3.094 | 3.028 |
| 2015-02-24 | 3.17 | 3.029 |
| 2015-02-25 | 3.227 | 3.028 |
| 2015-02-26 | 3.104 | 3.035 |
| 2015-02-27 | 3.099 | 3.036 |
| 2015-03-02 | 3.154 | 3.045 |
| 2015-03-03 | 3.174 | 3.031 |
| 2015-03-04 | 3.162 | 3.04 |
| 2015-03-05 | 3.113 | 3.04 |
| 2015-03-06 | 3.149 | 3.037 |
| 2015-03-09 | 3.078 | 2.99 |
| 2015-03-10 | 3.151 | 2.983 |
| 2015-03-11 | 3.096 | 3.023 |
| 2015-03-12 | 3.137 | 2.987 |
| 2015-03-13 | 3.051 | 2.989 |
| 2015-03-16 | 3.126 | 2.987 |
| 2015-03-17 | 3.079 | 2.989 |
| 2015-03-18 | 3.053 | 2.992 |
| 2015-03-19 | 3.111 | 2.991 |
| 2015-03-20 | 3.094 | 2.991 |
| 2015-03-23 | 3.062 | 2.989 |
| 2015-03-24 | 3.048 | 2.99 |
| 2015-03-25 | 3.038 | 2.98 |
| 2015-03-26 | 3.012 | 2.979 |
| 2015-03-27 | 3.045 | 3.001 |
| 2015-03-30 | 3.099 | 2.978 |
| 2015-03-31 | 3.024 | 2.976 |
| 2015-04-01 | 2.994 | 2.981 |
| 2015-04-02 | 3.032 | 2.981 |
| 2015-04-03 | 3.075 | 2.99 |
| 2015-04-06 | 3.096 | 2.987 |
| 2015-04-07 | 3.074 | 2.978 |
| 2015-04-08 | 2.998 | 2.963 |
| 2015-04-09 | 3.04 | 2.963 |
| 2015-04-10 | 3.065 | 2.953 |
| 2015-04-13 | 3.033 | 2.927 |
| 2015-04-14 | 2.967 | 2.922 |
| 2015-04-15 | 2.969 | 2.911 |
| 2015-04-16 | 3.021 | 2.902 |
| 2015-04-17 | 2.967 | 2.901 |
| 2015-04-20 | 2.97 | 2.878 |
| 2015-04-21 | 2.966 | 2.874 |
| 2015-04-22 | 3.011 | 2.87 |
| 2015-04-23 | 3.015 | 2.867 |
| 2015-04-24 | 2.94 | 2.855 |
| 2015-04-27 | 2.935 | 2.849 |
| 2015-04-28 | 2.914 | 2.839 |
| 2015-04-29 | 2.962 | 2.837 |
| 2015-04-30 | 2.943 | 2.835 |
| 2015-05-01 | 2.89 | 2.835 |
| 2015-05-04 | 2.899 | 2.834 |
| 2015-05-05 | 2.919 | 2.81 |
| 2015-05-06 | 2.909 | 2.807 |
| 2015-05-07 | 2.879 | 2.811 |
| 2015-05-08 | 2.86 | 2.81 |
| 2015-05-11 | 2.88 | 2.804 |
| 2015-05-12 | 2.93 | 2.805 |
| 2015-05-13 | 2.846 | 2.803 |
| 2015-05-14 | 2.893 | 2.802 |
| 2015-05-15 | 2.862 | 2.796 |
| 2015-05-18 | 2.93 | 2.791 |
| 2015-05-19 | 2.864 | 2.778 |
| 2015-05-20 | 2.895 | 2.78 |
| 2015-05-21 | 2.919 | 2.781 |
| 2015-05-22 | 2.85 | 2.769 |
| 2015-05-25 | 2.882 | 2.768 |
| 2015-05-26 | 2.851 | 2.768 |
| 2015-05-27 | 2.848 | 2.768 |
| 2015-05-28 | 2.821 | 2.732 |
| 2015-05-29 | 2.854 | 2.734 |
| 2015-06-01 | 2.806 | 2.705 |
| 2015-06-02 | 2.835 | 2.704 |
| 2015-06-03 | 2.814 | 2.703 |
| 2015-06-04 | 2.746 | 2.677 |
| 2015-06-05 | 2.769 | 2.676 |
| 2015-06-08 | 2.712 | 2.641 |
| 2015-06-09 | 2.704 | 2.639 |
| 2015-06-10 | 2.785 | 2.64 |
| 2015-06-11 | 2.728 | 2.638 |
| 2015-06-12 | 2.783 | 2.643 |
| 2015-06-15 | 2.739 | 2.631 |
| 2015-06-16 | 2.74 | 2.627 |
| 2015-06-17 | 2.737 | 2.626 |
| 2015-06-18 | 2.711 | 2.601 |
| 2015-06-19 | 2.747 | 2.575 |
| 2015-06-22 | 2.686 | 2.578 |
| 2015-06-23 | 2.74 | 2.569 |
| 2015-06-24 | 2.712 | 2.566 |
| 2015-06-25 | 2.712 | 2.557 |
| 2015-06-26 | 2.658 | 2.529 |
| 2015-06-29 | 2.735 | 2.53 |
| 2015-06-30 | 2.705 | 2.494 |
| 2015-07-01 | 2.667 | 2.492 |
| 2015-07-02 | 2.593 | 2.481 |
| 2015-07-03 | 2.617 | 2.459 |
| 2015-07-06 | 2.52 | 2.418 |
| 2015-07-07 | 2.5 | 2.396 |
| 2015-07-08 | 2.437 | 2.339 |
| 2015-07-09 | 2.418 | 2.313 |
| 2015-07-10 | 2.424 | 2.309 |
| 2015-07-13 | 2.404 | 2.299 |
| 2015-07-14 | 2.404 | 2.299 |
| 2015-07-15 | 2.45 | 2.295 |
| 2015-07-16 | 2.449 | 2.312 |
| 2015-07-17 | 2.448 | 2.314 |
| 2015-07-20 | 2.402 | 2.312 |
| 2015-07-21 | 2.465 | 2.31 |
| 2015-07-22 | 2.446 | 2.313 |
| 2015-07-23 | 2.408 | 2.312 |
| 2015-07-24 | 2.407 | 2.31 |
| 2015-07-27 | 2.387 | 2.269 |
| 2015-07-28 | 2.371 | 2.267 |
| 2015-07-29 | 2.413 | 2.266 |
| 2015-07-30 | 2.429 | 2.265 |
| 2015-07-31 | 2.377 | 2.265 |
| 2015-08-03 | 2.4 | 2.261 |
| 2015-08-04 | 2.388 | 2.261 |
| 2015-08-05 | 2.423 | 2.258 |
| 2015-08-06 | 2.412 | 2.259 |
| 2015-08-07 | 2.348 | 2.258 |
| 2015-08-10 | 2.358 | 2.255 |
| 2015-08-11 | 2.418 | 2.253 |
| 2015-08-12 | 2.351 | 2.25 |
| 2015-08-13 | 2.384 | 2.255 |
| 2015-08-14 | 2.352 | 2.254 |
| 2015-08-17 | 2.418 | 2.252 |
| 2015-08-18 | 2.411 | 2.246 |
| 2015-08-19 | 2.348 | 2.246 |
| 2015-08-20 | 2.396 | 2.239 |
| 2015-08-21 | 2.355 | 2.235 |
| 2015-08-24 | 2.351 | 2.179 |
| 2015-08-25 | 2.312 | 2.155 |
| 2015-08-26 | 2.285 | 2.137 |
| 2015-08-27 | 2.233 | 2.103 |
| 2015-08-28 | 2.263 | 2.1 |
| 2015-08-31 | 2.192 | 2.089 |
| 2015-09-01 | 2.199 | 2.082 |
| 2015-09-02 | 2.162 | 2.079 |
| 2015-09-03 | 2.179 | 2.08 |
| 2015-09-04 | 2.19 | 2.078 |
| 2015-09-07 | 2.11 | 2.058 |
| 2015-09-08 | 2.171 | 2.054 |
| 2015-09-09 | 2.183 | 2.052 |
| 2015-09-10 | 2.121 | 2.055 |
| 2015-09-11 | 2.121 | 2.054 |
| 2015-09-14 | 2.104 | 2.048 |
| 2015-09-15 | 2.169 | 2.049 |
| 2015-09-16 | 2.184 | 2.048 |
| 2015-09-17 | 2.161 | 2.044 |
| 2015-09-18 | 2.157 | 2.044 |
| 2015-09-21 | 2.14 | 2.042 |
| 2015-09-22 | 2.132 | 2.042 |
| 2015-09-23 | 2.122 | 2.04 |
| 2015-09-24 | 2.17 | 2.041 |
| 2015-09-25 | 2.145 | 2.04 |
| 2015-09-28 | 2.157 | 2.039 |
| 2015-09-29 | 2.172 | 2.037 |
| 2015-09-30 | 2.088 | 2.035 |
| 2015-10-01 | 2.176 | 2.036 |
| 2015-10-02 | 2.129 | 2.036 |
| 2015-10-05 | 2.15 | 2.036 |
| 2015-10-06 | 2.135 | 2.036 |
| 2015-10-07 | 2.18 | 2.036 |
| 2015-10-08 | 2.129 | 2.034 |
| 2015-10-09 | 2.175 | 2.035 |
| 2015-10-12 | 2.166 | 2.033 |
| 2015-10-13 | 2.096 | 2.032 |
| 2015-10-14 | 2.159 | 2.031 |
| 2015-10-15 | 2.167 | 2.033 |
| 2015-10-16 | 2.103 | 2.033 |
| 2015-10-19 | 2.153 | 2.035 |
| 2015-10-20 | 2.13 | 2.034 |
| 2015-10-21 | 2.097 | 2.037 |
| 2015-10-22 | 2.147 | 2.037 |
| 2015-10-23 | 2.157 | 2.036 |
| 2015-10-26 | 2.15 | 2.038 |
| 2015-10-27 | 2.104 | 2.037 |
| 2015-10-28 | 2.144 | 2.036 |
| 2015-10-29 | 2.099 | 2.04 |
| 2015-10-30 | 2.152 | 2.043 |
| 2015-11-02 | 2.122 | 2.044 |
| 2015-11-03 | 2.137 | 2.045 |
| 2015-11-04 | 2.185 | 2.039 |
| 2015-11-05 | 2.176 | 2.038 |
| 2015-11-06 | 2.175 | 2.039 |
| 2015-11-09 | 2.135 | 2.029 |
| 2015-11-10 | 2.098 | 2.026 |
| 2015-11-11 | 2.11 | 2.027 |
| 2015-11-12 | 2.144 | 2.026 |
| 2015-11-13 | 2.111 | 2.025 |
| 2015-11-16 | 2.147 | 2.03 |
| 2015-11-17 | 2.135 | 2.032 |
| 2015-11-18 | 2.203 | 2.063 |
| 2015-11-19 | 2.197 | 2.063 |
| 2015-11-20 | 2.183 | 2.086 |
| 2015-11-23 | 2.175 | 2.088 |
| 2015-11-24 | 2.161 | 2.109 |
| 2015-11-25 | 2.217 | 2.111 |
| 2015-11-26 | 2.26 | 2.116 |
| 2015-11-27 | 2.277 | 2.144 |
| 2015-11-30 | 2.335 | 2.152 |
| 2015-12-01 | 2.336 | 2.153 |
| 2015-12-02 | 2.293 | 2.134 |
| 2015-12-03 | 2.253 | 2.136 |
| 2015-12-04 | 2.27 | 2.143 |
| 2015-12-07 | 2.276 | 2.17 |
| 2015-12-08 | 2.282 | 2.168 |
| 2015-12-09 | 2.29 | 2.171 |
| 2015-12-10 | 2.333 | 2.183 |
| 2015-12-11 | 2.364 | 2.189 |
| 2015-12-14 | 2.407 | 2.198 |
| 2015-12-15 | 2.379 | 2.208 |
| 2015-12-16 | 2.362 | 2.216 |
| 2015-12-17 | 2.399 | 2.216 |
| 2015-12-18 | 2.383 | 2.224 |
| 2015-12-21 | 2.466 | 2.216 |
| 2015-12-22 | 2.465 | 2.213 |
| 2015-12-23 | 2.438 | 2.214 |
| 2015-12-24 | 2.465 | 2.213 |
| 2015-12-25 | 2.409 | 2.216 |
| 2015-12-28 | 2.456 | 2.21 |
| 2015-12-29 | 2.421 | 2.218 |
| 2015-12-30 | 2.406 | 2.216 |
| 2015-12-31 | 2.441 | 2.216 |
| 2016-01-01 | 2.482 | 2.215 |
| 2016-01-04 | 2.505 | 2.204 |
| 2016-01-05 | 2.426 | 2.209 |
| 2016-01-06 | 2.448 | 2.211 |
| 2016-01-07 | 2.574 | 2.257 |
| 2016-01-08 | 2.538 | 2.258 |
| 2016-01-11 | 2.593 | 2.265 |
| 2016-01-12 | 2.533 | 2.263 |
| 2016-01-13 | 2.541 | 2.262 |
| 2016-01-14 | 2.598 | 2.262 |
| 2016-01-15 | 2.635 | 2.262 |
| 2016-01-18 | 2.649 | 2.263 |
| 2016-01-19 | 2.624 | 2.264 |
| 2016-01-20 | 2.593 | 2.262 |
| 2016-01-21 | 2.625 | 2.265 |
| 2016-01-22 | 2.61 | 2.271 |
| 2016-01-25 | 2.586 | 2.27 |
| 2016-01-26 | 2.542 | 2.262 |
| 2016-01-27 | 2.575 | 2.263 |
| 2016-01-28 | 2.609 | 2.261 |
| 2016-01-29 | 2.552 | 2.26 |
| 2016-02-01 | 2.562 | 2.259 |
| 2016-02-02 | 2.554 | 2.258 |
| 2016-02-03 | 2.625 | 2.257 |
| 2016-02-04 | 2.59 | 2.256 |
| 2016-02-05 | 2.61 | 2.251 |
| 2016-02-08 | 2.585 | 2.251 |
| 2016-02-09 | 2.616 | 2.251 |
| 2016-02-10 | 2.6 | 2.252 |
| 2016-02-11 | 2.646 | 2.251 |
| 2016-02-12 | 2.645 | 2.249 |
| 2016-02-15 | 2.559 | 2.251 |
| 2016-02-16 | 2.581 | 2.252 |
| 2016-02-17 | 2.647 | 2.249 |
| 2016-02-18 | 2.655 | 2.253 |
| 2016-02-19 | 2.666 | 2.258 |
| 2016-02-22 | 2.569 | 2.254 |
| 2016-02-23 | 2.666 | 2.256 |
| 2016-02-24 | 2.58 | 2.256 |
| 2016-02-25 | 2.616 | 2.275 |
| 2016-02-26 | 2.58 | 2.278 |
| 2016-02-29 | 2.683 | 2.277 |
| 2016-03-01 | 2.65 | 2.297 |
| 2016-03-02 | 2.573 | 2.293 |
| 2016-03-03 | 2.585 | 2.294 |
| 2016-03-04 | 2.625 | 2.281 |
| 2016-03-07 | 2.617 | 2.287 |
| 2016-03-08 | 2.573 | 2.285 |
| 2016-03-09 | 2.676 | 2.287 |
| 2016-03-10 | 2.673 | 2.284 |
| 2016-03-11 | 2.653 | 2.28 |
| 2016-03-14 | 2.693 | 2.282 |
| 2016-03-15 | 2.68 | 2.282 |
| 2016-03-16 | 2.576 | 2.278 |
| 2016-03-17 | 2.607 | 2.288 |
| 2016-03-18 | 2.591 | 2.289 |
| 2016-03-21 | 2.609 | 2.29 |
| 2016-03-22 | 2.679 | 2.289 |
| 2016-03-23 | 2.703 | 2.289 |
| 2016-03-24 | 2.653 | 2.289 |
| 2016-03-25 | 2.655 | 2.297 |
| 2016-03-28 | 2.607 | 2.303 |
| 2016-03-29 | 2.677 | 2.303 |
| 2016-03-30 | 2.712 | 2.307 |
| 2016-03-31 | 2.673 | 2.321 |
| 2016-04-01 | 2.663 | 2.323 |
| 2016-04-04 | 2.729 | 2.329 |
| 2016-04-05 | 2.668 | 2.336 |
| 2016-04-06 | 2.667 | 2.337 |
| 2016-04-07 | 2.655 | 2.348 |
| 2016-04-08 | 2.763 | 2.35 |
| 2016-04-11 | 2.749 | 2.355 |
| 2016-04-12 | 2.767 | 2.355 |
| 2016-04-13 | 2.657 | 2.361 |
| 2016-04-14 | 2.687 | 2.366 |
| 2016-04-15 | 2.799 | 2.372 |
| 2016-04-18 | 2.72 | 2.37 |
| 2016-04-19 | 2.705 | 2.374 |
| 2016-04-20 | 2.698 | 2.374 |
| 2016-04-21 | 2.757 | 2.375 |
| 2016-04-22 | 2.772 | 2.39 |
| 2016-04-25 | 2.73 | 2.388 |
| 2016-04-26 | 2.794 | 2.389 |
| 2016-04-27 | 2.772 | 2.391 |
| 2016-04-28 | 2.842 | 2.391 |
| 2016-04-29 | 2.722 | 2.395 |
| 2016-05-02 | 2.776 | 2.395 |
| 2016-05-03 | 2.715 | 2.396 |
| 2016-05-04 | 2.734 | 2.399 |
| 2016-05-05 | 2.719 | 2.4 |
| 2016-05-06 | 2.849 | 2.409 |
| 2016-05-09 | 2.731 | 2.406 |
| 2016-05-10 | 2.761 | 2.411 |
| 2016-05-11 | 2.818 | 2.418 |
| 2016-05-12 | 2.851 | 2.419 |
| 2016-05-13 | 2.867 | 2.419 |
| 2016-05-16 | 2.794 | 2.423 |
| 2016-05-17 | 2.846 | 2.446 |
| 2016-05-18 | 2.815 | 2.446 |
| 2016-05-19 | 2.862 | 2.468 |
| 2016-05-20 | 2.837 | 2.467 |
| 2016-05-23 | 2.872 | 2.472 |
| 2016-05-24 | 2.813 | 2.494 |
| 2016-05-25 | 2.922 | 2.496 |
| 2016-05-26 | 2.999 | 2.531 |
| 2016-05-27 | 2.879 | 2.535 |
| 2016-05-30 | 2.96 | 2.537 |
| 2016-05-31 | 2.919 | 2.534 |
| 2016-06-01 | 2.933 | 2.535 |
| 2016-06-02 | 2.889 | 2.547 |
| 2016-06-03 | 2.965 | 2.55 |
| 2016-06-06 | 2.961 | 2.547 |
| 2016-06-07 | 2.961 | 2.572 |
| 2016-06-08 | 2.942 | 2.594 |
| 2016-06-09 | 3.002 | 2.595 |
| 2016-06-10 | 3.075 | 2.604 |
| 2016-06-13 | 3.051 | 2.604 |
| 2016-06-14 | 3.063 | 2.612 |
| 2016-06-15 | 3.006 | 2.646 |
| 2016-06-16 | 3.086 | 2.648 |
| 2016-06-17 | 3.051 | 2.696 |
| 2016-06-20 | 3.085 | 2.709 |
| 2016-06-21 | 3.227 | 2.719 |
| 2016-06-22 | 3.232 | 2.744 |
| 2016-06-23 | 3.374 | 2.806 |
| 2016-06-24 | 3.426 | 2.847 |
| 2016-06-27 | 3.609 | 2.934 |
| 2016-06-28 | 3.66 | 2.992 |
| 2016-06-29 | 3.607 | 2.997 |
| 2016-06-30 | 3.633 | 3.01 |
| 2016-07-01 | 3.599 | 3.025 |
| 2016-07-04 | 3.733 | 3.032 |
| 2016-07-05 | 3.687 | 3.037 |
| 2016-07-06 | 3.689 | 3.038 |
| 2016-07-07 | 3.717 | 3.041 |
| 2016-07-08 | 3.641 | 3.043 |
| 2016-07-11 | 3.663 | 3.047 |
| 2016-07-12 | 3.559 | 3.045 |
| 2016-07-13 | 3.523 | 3.041 |
| 2016-07-14 | 3.659 | 3.144 |
| 2016-07-15 | 3.775 | 3.149 |
| 2016-07-18 | 3.732 | 3.146 |
| 2016-07-19 | 3.763 | 3.153 |
| 2016-07-20 | 3.746 | 3.155 |
| 2016-07-21 | 3.698 | 3.169 |
| 2016-07-22 | 3.69 | 3.166 |
| 2016-07-25 | 3.646 | 3.17 |
| 2016-07-26 | 3.802 | 3.17 |
| 2016-07-27 | 3.658 | 3.172 |
| 2016-07-28 | 3.687 | 3.18 |
| 2016-07-29 | 3.659 | 3.183 |
| 2016-08-01 | 3.723 | 3.188 |
| 2016-08-02 | 3.8 | 3.187 |
| 2016-08-03 | 3.709 | 3.187 |
| 2016-08-04 | 3.662 | 3.189 |
| 2016-08-05 | 3.688 | 3.205 |
| 2016-08-08 | 3.689 | 3.211 |
| 2016-08-09 | 3.737 | 3.221 |
| 2016-08-10 | 3.778 | 3.236 |
| 2016-08-11 | 3.984 | 3.391 |
| 2016-08-12 | 4.251 | 3.474 |
| 2016-08-15 | 4.21 | 3.534 |
| 2016-08-16 | 4.404 | 3.689 |
| 2016-08-17 | 4.377 | 3.697 |
| 2016-08-18 | 4.267 | 3.775 |
| 2016-08-19 | 4.526 | 3.803 |
| 2016-08-22 | 4.795 | 3.822 |
| 2016-08-23 | 4.923 | 3.818 |
| 2016-08-24 | 4.771 | 3.82 |
| 2016-08-25 | 5.103 | 3.968 |
| 2016-08-26 | 5.127 | 3.994 |
| 2016-08-29 | 5.343 | 3.993 |
| 2016-08-30 | 5.335 | 3.997 |
| 2016-08-31 | 5.238 | 3.999 |
| 2016-09-01 | 5.341 | 4.036 |
| 2016-09-02 | 5.319 | 4.046 |
| 2016-09-05 | 5.325 | 4.051 |
| 2016-09-06 | 5.176 | 4.064 |
| 2016-09-07 | 5.272 | 4.066 |
| 2016-09-08 | 5.317 | 4.067 |
| 2016-09-09 | 5.361 | 4.071 |
| 2016-09-12 | 5.254 | 4.072 |
| 2016-09-13 | 5.194 | 4.076 |
| 2016-09-14 | 5.236 | 4.083 |
| 2016-09-15 | 5.354 | 4.085 |
| 2016-09-16 | 5.381 | 4.094 |
| 2016-09-19 | 5.362 | 4.103 |
| 2016-09-20 | 5.178 | 4.105 |
| 2016-09-21 | 5.298 | 4.1 |
| 2016-09-22 | 5.267 | 4.104 |
| 2016-09-23 | 5.283 | 4.103 |
| 2016-09-26 | 5.305 | 4.104 |
| 2016-09-27 | 5.313 | 4.114 |
| 2016-09-28 | 5.292 | 4.114 |
| 2016-09-29 | 5.267 | 4.128 |
| 2016-09-30 | 5.211 | 4.134 |
| 2016-10-03 | 5.423 | 4.131 |
| 2016-10-04 | 5.394 | 4.142 |
| 2016-10-05 | 5.36 | 4.143 |
| 2016-10-06 | 5.335 | 4.147 |
| 2016-10-07 | 5.369 | 4.147 |
| 2016-10-10 | 5.514 | 4.184 |
| 2016-10-11 | 5.382 | 4.197 |
| 2016-10-12 | 5.54 | 4.195 |
| 2016-10-13 | 5.492 | 4.196 |
| 2016-10-14 | 5.487 | 4.198 |
| 2016-10-17 | 5.606 | 4.202 |
| 2016-10-18 | 5.504 | 4.203 |
| 2016-10-19 | 5.479 | 4.204 |
| 2016-10-20 | 5.378 | 4.209 |
| 2016-10-21 | 5.567 | 4.212 |
| 2016-10-24 | 5.527 | 4.246 |
| 2016-10-25 | 5.466 | 4.28 |
| 2016-10-26 | 5.618 | 4.284 |
| 2016-10-27 | 5.635 | 4.373 |
| 2016-10-28 | 5.766 | 4.38 |
| 2016-10-31 | 5.896 | 4.394 |
| 2016-11-01 | 5.714 | 4.398 |
| 2016-11-02 | 5.738 | 4.405 |
| 2016-11-03 | 5.759 | 4.401 |
| 2016-11-04 | 5.764 | 4.404 |
| 2016-11-07 | 5.897 | 4.421 |
| 2016-11-08 | 5.786 | 4.441 |
| 2016-11-09 | 5.839 | 4.444 |
| 2016-11-10 | 5.839 | 4.445 |
| 2016-11-11 | 5.869 | 4.448 |
| 2016-11-14 | 5.865 | 4.452 |
| 2016-11-15 | 5.725 | 4.457 |
| 2016-11-16 | 5.947 | 4.537 |
| 2016-11-17 | 5.819 | 4.557 |
| 2016-11-18 | 5.884 | 4.559 |
| 2016-11-21 | 6.185 | 4.761 |
| 2016-11-22 | 6.257 | 4.773 |
| 2016-11-23 | 6.368 | 4.801 |
| 2016-11-24 | 6.396 | 4.813 |
| 2016-11-25 | 6.38 | 4.813 |
| 2016-11-28 | 6.197 | 4.822 |
| 2016-11-29 | 6.316 | 4.823 |
| 2016-11-30 | 6.283 | 4.83 |
| 2016-12-01 | 6.364 | 4.86 |
| 2016-12-02 | 6.415 | 4.873 |
| 2016-12-05 | 6.433 | 4.869 |
| 2016-12-06 | 6.348 | 4.874 |
| 2016-12-07 | 6.457 | 4.892 |
| 2016-12-08 | 6.517 | 4.974 |
| 2016-12-09 | 6.374 | 4.955 |
| 2016-12-12 | 6.287 | 4.958 |
| 2016-12-13 | 6.22 | 4.95 |
| 2016-12-14 | 6.165 | 4.951 |
| 2016-12-15 | 6.396 | 4.937 |
| 2016-12-16 | 6.231 | 4.943 |
| 2016-12-19 | 6.388 | 4.951 |
| 2016-12-20 | 6.165 | 4.951 |
| 2016-12-21 | 6.386 | 4.947 |
| 2016-12-22 | 6.511 | 5.103 |
| 2016-12-23 | 6.226 | 5.11 |
| 2016-12-26 | 6.399 | 5.114 |
| 2016-12-27 | 6.427 | 5.261 |
| 2016-12-28 | 6.628 | 5.275 |
| 2016-12-29 | 6.65 | 5.376 |
| 2016-12-30 | 6.641 | 5.375 |
| 2017-01-02 | 6.563 | 5.388 |
| 2017-01-03 | 6.709 | 5.377 |
| 2017-01-04 | 6.642 | 5.43 |
| 2017-01-05 | 6.771 | 5.439 |
| 2017-01-06 | 6.77 | 5.454 |
| 2017-01-09 | 6.892 | 5.486 |
| 2017-01-10 | 6.824 | 5.51 |
| 2017-01-11 | 6.864 | 5.512 |
| 2017-01-12 | 6.816 | 5.518 |
| 2017-01-13 | 7.174 | 5.684 |
| 2017-01-16 | 7.143 | 5.675 |
| 2017-01-17 | 7.237 | 5.695 |
| 2017-01-18 | 7.18 | 5.739 |
| 2017-01-19 | 7.301 | 5.781 |
| 2017-01-20 | 7.286 | 5.788 |
| 2017-01-23 | 7.279 | 5.802 |
| 2017-01-24 | 7.383 | 5.818 |
| 2017-01-25 | 7.454 | 5.86 |
| 2017-01-26 | 7.158 | 5.856 |
| 2017-01-27 | 7.203 | 5.856 |
| 2017-01-30 | 7.43 | 5.855 |
| 2017-01-31 | 7.173 | 5.857 |
| 2017-02-01 | 7.356 | 5.861 |
| 2017-02-02 | 7.428 | 5.881 |
| 2017-02-03 | 7.508 | 5.908 |
| 2017-02-06 | 7.34 | 5.914 |
| 2017-02-07 | 7.341 | 5.912 |
| 2017-02-08 | 7.329 | 5.921 |
| 2017-02-09 | 7.534 | 5.961 |
| 2017-02-10 | 7.603 | 5.98 |
| 2017-02-13 | 7.455 | 5.976 |
| 2017-02-14 | 7.515 | 6.144 |
| 2017-02-15 | 7.539 | 6.15 |
| 2017-02-16 | 7.56 | 6.169 |
| 2017-02-17 | 7.574 | 6.161 |
| 2017-02-20 | 7.778 | 6.208 |
| 2017-02-21 | 7.715 | 6.218 |
| 2017-02-22 | 7.847 | 6.487 |
| 2017-02-23 | 8.054 | 6.516 |
| 2017-02-24 | 8.08 | 6.519 |
| 2017-02-27 | 7.991 | 6.522 |
| 2017-02-28 | 8.159 | 6.602 |
| 2017-03-01 | 8.238 | 6.706 |
| 2017-03-02 | 8.228 | 6.703 |
| 2017-03-03 | 8.118 | 6.758 |
| 2017-03-06 | 8.165 | 6.908 |
| 2017-03-07 | 8.221 | 6.953 |
| 2017-03-08 | 8.309 | 6.961 |
| 2017-03-09 | 8.308 | 6.967 |
| 2017-03-10 | 8.258 | 6.968 |
| 2017-03-13 | 8.381 | 6.958 |
| 2017-03-14 | 8.414 | 7 |
| 2017-03-15 | 8.429 | 6.995 |
| 2017-03-16 | 8.266 | 7.025 |
| 2017-03-17 | 8.128 | 6.988 |
| 2017-03-20 | 8.241 | 7.078 |
| 2017-03-21 | 8.361 | 7.077 |
| 2017-03-22 | 8.23 | 7.056 |
| 2017-03-23 | 8.18 | 7.049 |
| 2017-03-24 | 8.231 | 7.05 |
| 2017-03-27 | 8.171 | 7.056 |
| 2017-03-28 | 8.235 | 7.072 |
| 2017-03-29 | 8.38 | 7.072 |
| 2017-03-30 | 8.325 | 7.081 |
| 2017-03-31 | 8.255 | 7.064 |
| 2017-04-03 | 8.488 | 7.084 |
| 2017-04-04 | 8.393 | 7.089 |
| 2017-04-05 | 8.186 | 7.088 |
| 2017-04-06 | 8.313 | 7.112 |
| 2017-04-07 | 8.361 | 7.105 |
| 2017-04-10 | 8.205 | 7.122 |
| 2017-04-11 | 8.262 | 7.143 |
| 2017-04-12 | 8.398 | 7.136 |
| 2017-04-13 | 8.351 | 7.152 |
| 2017-04-14 | 8.447 | 7.133 |
| 2017-04-17 | 8.463 | 7.136 |
| 2017-04-18 | 8.443 | 7.094 |
| 2017-04-19 | 8.149 | 7.073 |
| 2017-04-20 | 8.4 | 7.055 |
| 2017-04-21 | 8.222 | 7.055 |
| 2017-04-24 | 8.239 | 7.05 |
| 2017-04-25 | 8.338 | 7.046 |
| 2017-04-26 | 8.286 | 7.055 |
| 2017-04-27 | 8.167 | 7.069 |
| 2017-04-28 | 8.163 | 7.081 |
| 2017-05-01 | 8.27 | 7.085 |
| 2017-05-02 | 8.092 | 7.087 |
| 2017-05-03 | 8.359 | 7.082 |
| 2017-05-04 | 8.357 | 7.072 |
| 2017-05-05 | 8.176 | 7.072 |
| 2017-05-08 | 8.275 | 7.094 |
| 2017-05-09 | 8.3 | 7.099 |
| 2017-05-10 | 8.326 | 7.096 |
| 2017-05-11 | 8.087 | 7.103 |
| 2017-05-12 | 7.901 | 6.967 |
| 2017-05-15 | 8.193 | 6.975 |
| 2017-05-16 | 8.13 | 6.974 |
| 2017-05-17 | 7.999 | 6.965 |
| 2017-05-18 | 7.997 | 6.971 |
| 2017-05-19 | 8.123 | 7.066 |
| 2017-05-22 | 8.009 | 7.071 |
| 2017-05-23 | 8.048 | 7 |
| 2017-05-24 | 8.017 | 6.997 |
| 2017-05-25 | 8.061 | 6.762 |
| 2017-05-26 | 7.901 | 6.755 |
| 2017-05-29 | 7.984 | 6.742 |
| 2017-05-30 | 7.924 | 6.742 |
| 2017-05-31 | 7.848 | 6.733 |
| 2017-06-01 | 8.031 | 6.776 |
| 2017-06-02 | 8.013 | 6.771 |
| 2017-06-05 | 7.88 | 6.743 |
| 2017-06-06 | 7.869 | 6.753 |
| 2017-06-07 | 7.823 | 6.743 |
| 2017-06-08 | 7.667 | 6.742 |
| 2017-06-09 | 7.878 | 6.736 |
| 2017-06-12 | 7.785 | 6.736 |
| 2017-06-13 | 7.683 | 6.748 |
| 2017-06-14 | 8.036 | 6.704 |
| 2017-06-15 | 8.074 | 6.705 |
| 2017-06-16 | 7.882 | 6.702 |
| 2017-06-19 | 8.087 | 6.725 |
| 2017-06-20 | 8.042 | 6.737 |
| 2017-06-21 | 8.046 | 6.748 |
| 2017-06-22 | 8.11 | 6.708 |
| 2017-06-23 | 8.18 | 6.707 |
| 2017-06-26 | 8.106 | 6.702 |
| 2017-06-27 | 8.453 | 6.682 |
| 2017-06-28 | 8.723 | 6.67 |
| 2017-06-29 | 8.831 | 6.671 |
| 2017-06-30 | 8.764 | 6.691 |
| 2017-07-03 | 8.713 | 6.789 |
| 2017-07-04 | 8.919 | 6.79 |
| 2017-07-05 | 8.884 | 6.776 |
| 2017-07-06 | 8.902 | 6.808 |
| 2017-07-07 | 8.77 | 6.728 |
| 2017-07-10 | 8.868 | 6.739 |
| 2017-07-11 | 8.619 | 6.625 |
| 2017-07-12 | 8.71 | 6.622 |
| 2017-07-13 | 8.408 | 6.552 |
| 2017-07-14 | 8.564 | 6.52 |
| 2017-07-17 | 8.088 | 6.454 |
| 2017-07-18 | 8.238 | 6.451 |
| 2017-07-19 | 8.124 | 6.438 |
| 2017-07-20 | 8.104 | 6.441 |
| 2017-07-21 | 8.058 | 6.426 |
| 2017-07-24 | 8.02 | 6.402 |
| 2017-07-25 | 7.905 | 6.395 |
| 2017-07-26 | 7.96 | 6.393 |
| 2017-07-27 | 8.101 | 6.383 |
| 2017-07-28 | 8.05 | 6.385 |
| 2017-07-31 | 7.951 | 6.375 |
| 2017-08-01 | 7.999 | 6.37 |
| 2017-08-02 | 7.904 | 6.444 |
| 2017-08-03 | 8.105 | 6.492 |
| 2017-08-04 | 8.3 | 6.537 |
| 2017-08-07 | 8.126 | 6.539 |
| 2017-08-08 | 8.141 | 6.543 |
| 2017-08-09 | 8.174 | 6.502 |
| 2017-08-10 | 7.992 | 6.502 |
| 2017-08-11 | 8.15 | 6.451 |
| 2017-08-14 | 7.993 | 6.442 |
| 2017-08-15 | 7.761 | 6.429 |
| 2017-08-16 | 7.936 | 6.421 |
| 2017-08-17 | 7.954 | 6.427 |
| 2017-08-18 | 8.016 | 6.439 |
| 2017-08-21 | 7.808 | 6.437 |
| 2017-08-22 | 7.896 | 6.436 |
| 2017-08-23 | 7.925 | 6.424 |
| 2017-08-24 | 7.798 | 6.413 |
| 2017-08-25 | 7.557 | 6.247 |
| 2017-08-28 | 7.569 | 6.24 |
| 2017-08-29 | 7.505 | 6.223 |
| 2017-08-30 | 7.375 | 6.214 |
| 2017-08-31 | 7.378 | 6.235 |
| 2017-09-01 | 7.328 | 6.228 |
| 2017-09-04 | 7.422 | 6.222 |
| 2017-09-05 | 7.347 | 6.211 |
| 2017-09-06 | 7.247 | 6.202 |
| 2017-09-07 | 7.384 | 6.197 |
| 2017-09-08 | 7.302 | 6.193 |
| 2017-09-11 | 7.39 | 6.19 |
| 2017-09-12 | 7.351 | 6.196 |
| 2017-09-13 | 7.326 | 6.191 |
| 2017-09-14 | 7.221 | 6.197 |
| 2017-09-15 | 7.288 | 6.196 |
| 2017-09-18 | 7.221 | 6.199 |
| 2017-09-19 | 7.331 | 6.203 |
| 2017-09-20 | 7.196 | 6.197 |
| 2017-09-21 | 7.127 | 6.196 |
| 2017-09-22 | 7.063 | 6.191 |
| 2017-09-25 | 7.103 | 6.189 |
| 2017-09-26 | 7.032 | 6.178 |
| 2017-09-27 | 7.206 | 6.171 |
| 2017-09-28 | 7.105 | 6.18 |
| 2017-09-29 | 7.03 | 6.172 |
| 2017-10-02 | 7.142 | 6.176 |
| 2017-10-03 | 7.178 | 6.18 |
| 2017-10-04 | 7.124 | 6.184 |
| 2017-10-05 | 6.985 | 6.188 |
| 2017-10-06 | 7.022 | 6.197 |
| 2017-10-09 | 7.124 | 6.175 |
| 2017-10-10 | 7.212 | 6.167 |
| 2017-10-11 | 7.061 | 6.17 |
| 2017-10-12 | 7.064 | 6.189 |
| 2017-10-13 | 7.114 | 6.186 |
| 2017-10-16 | 7.034 | 6.18 |
| 2017-10-17 | 7.019 | 6.182 |
| 2017-10-18 | 6.941 | 6.179 |
| 2017-10-19 | 7.044 | 6.185 |
| 2017-10-20 | 6.983 | 6.18 |
| 2017-10-23 | 6.955 | 6.18 |
| 2017-10-24 | 6.931 | 6.181 |
| 2017-10-25 | 6.85 | 6.18 |
| 2017-10-26 | 6.909 | 6.176 |
| 2017-10-27 | 6.815 | 6.158 |
| 2017-10-30 | 6.866 | 6.161 |
| 2017-10-31 | 6.737 | 6.157 |
| 2017-11-01 | 6.818 | 6.153 |
| 2017-11-02 | 6.895 | 6.157 |
| 2017-11-03 | 6.906 | 6.156 |
| 2017-11-06 | 6.778 | 6.143 |
| 2017-11-07 | 6.868 | 6.115 |
| 2017-11-08 | 6.803 | 6.118 |
| 2017-11-09 | 6.676 | 6.121 |
| 2017-11-10 | 6.658 | 6.133 |
| 2017-11-13 | 6.768 | 6.151 |
| 2017-11-14 | 6.647 | 6.14 |
| 2017-11-15 | 6.665 | 6.165 |
| 2017-11-16 | 6.703 | 6.159 |
| 2017-11-17 | 6.647 | 6.062 |
| 2017-11-20 | 6.639 | 6.048 |
| 2017-11-21 | 6.67 | 6.046 |
| 2017-11-22 | 6.504 | 5.954 |
| 2017-11-23 | 6.574 | 5.937 |
| 2017-11-24 | 6.462 | 5.946 |
| 2017-11-27 | 6.379 | 5.942 |
| 2017-11-28 | 6.49 | 5.942 |
| 2017-11-29 | 6.469 | 6.026 |
| 2017-11-30 | 6.504 | 6.028 |
| 2017-12-01 | 6.517 | 6.042 |
| 2017-12-04 | 6.425 | 6.048 |
| 2017-12-05 | 6.627 | 6.185 |
| 2017-12-06 | 6.474 | 6.175 |
| 2017-12-07 | 6.651 | 6.175 |
| 2017-12-08 | 6.593 | 6.185 |
| 2017-12-11 | 6.587 | 6.19 |
| 2017-12-12 | 6.522 | 6.171 |
| 2017-12-13 | 6.66 | 6.174 |
| 2017-12-14 | 6.478 | 6.166 |
| 2017-12-15 | 6.658 | 6.152 |
| 2017-12-18 | 6.487 | 6.15 |
| 2017-12-19 | 6.525 | 6.135 |
| 2017-12-20 | 6.602 | 6.141 |
| 2017-12-21 | 6.471 | 6.142 |
| 2017-12-22 | 6.588 | 6.178 |
| 2017-12-25 | 6.41 | 6.17 |
| 2017-12-26 | 6.515 | 6.166 |
| 2017-12-27 | 6.428 | 6.154 |
| 2017-12-28 | 6.466 | 6.145 |
| 2017-12-29 | 6.543 | 6.145 |
| 2018-01-01 | 6.474 | 6.15 |
| 2018-01-02 | 6.509 | 6.121 |
| 2018-01-03 | 6.477 | 6.128 |
| 2018-01-04 | 6.517 | 6.158 |
| 2018-01-05 | 6.388 | 6.158 |
| 2018-01-08 | 6.513 | 6.157 |
| 2018-01-09 | 6.445 | 6.151 |
| 2018-01-10 | 6.3 | 6.072 |
| 2018-01-11 | 6.279 | 6.065 |
| 2018-01-12 | 6.35 | 6.071 |
| 2018-01-15 | 6.324 | 6.053 |
| 2018-01-16 | 6.258 | 6.051 |
| 2018-01-17 | 6.233 | 6.03 |
| 2018-01-18 | 5.959 | 5.999 |
| 2018-01-19 | 5.944 | 5.971 |
| 2018-01-22 | 5.955 | 5.931 |
| 2018-01-23 | 5.686 | 5.758 |
| 2018-01-24 | 5.677 | 5.73 |
| 2018-01-25 | 5.659 | 5.72 |
| 2018-01-26 | 5.683 | 5.705 |
| 2018-01-29 | 5.663 | 5.691 |
| 2018-01-30 | 5.616 | 5.632 |
| 2018-01-31 | 5.518 | 5.62 |
| 2018-02-01 | 5.554 | 5.611 |
| 2018-02-02 | 5.567 | 5.604 |
| 2018-02-05 | 5.467 | 5.41 |
| 2018-02-06 | 5.382 | 5.373 |
| 2018-02-07 | 5.153 | 5.339 |
| 2018-02-08 | 5.052 | 5.25 |
| 2018-02-09 | 5.02 | 5.153 |
| 2018-02-12 | 5.075 | 5.127 |
| 2018-02-13 | 5.055 | 5.122 |
| 2018-02-14 | 5.045 | 5.128 |
| 2018-02-15 | 4.959 | 5.131 |
| 2018-02-16 | 4.985 | 5.132 |
| 2018-02-19 | 4.991 | 5.138 |
| 2018-02-20 | 4.985 | 5.138 |
| 2018-02-21 | 4.95 | 5.14 |
| 2018-02-22 | 4.918 | 5.108 |
| 2018-02-23 | 4.977 | 5.095 |
| 2018-02-26 | 5.023 | 4.917 |
| 2018-02-27 | 4.94 | 4.904 |
| 2018-02-28 | 4.854 | 4.888 |
| 2018-03-01 | 4.945 | 4.892 |
| 2018-03-02 | 4.829 | 4.89 |
| 2018-03-05 | 4.936 | 4.893 |
| 2018-03-06 | 4.856 | 4.889 |
| 2018-03-07 | 4.853 | 4.902 |
| 2018-03-08 | 4.838 | 4.903 |
| 2018-03-09 | 4.893 | 4.902 |
| 2018-03-12 | 4.84 | 4.919 |
| 2018-03-13 | 4.829 | 4.921 |
| 2018-03-14 | 4.851 | 4.917 |
| 2018-03-15 | 4.828 | 4.919 |
| 2018-03-16 | 4.925 | 4.91 |
| 2018-03-19 | 4.802 | 4.909 |
| 2018-03-20 | 4.867 | 4.91 |
| 2018-03-21 | 4.812 | 4.917 |
| 2018-03-22 | 4.863 | 4.914 |
| 2018-03-23 | 4.753 | 4.877 |
| 2018-03-26 | 4.787 | 4.857 |
| 2018-03-27 | 4.766 | 4.85 |
| 2018-03-28 | 4.783 | 4.856 |
| 2018-03-29 | 4.747 | 4.845 |
| 2018-03-30 | 4.643 | 4.844 |
| 2018-04-02 | 4.68 | 4.843 |
| 2018-04-03 | 4.66 | 4.843 |
| 2018-04-04 | 4.736 | 4.849 |
| 2018-04-05 | 4.638 | 4.846 |
| 2018-04-06 | 4.67 | 4.867 |
| 2018-04-09 | 4.743 | 4.875 |
| 2018-04-10 | 4.576 | 4.844 |
| 2018-04-11 | 4.635 | 4.842 |
| 2018-04-12 | 4.59 | 4.835 |
| 2018-04-13 | 4.564 | 4.833 |
| 2018-04-16 | 4.502 | 4.818 |
| 2018-04-17 | 4.555 | 4.821 |
| 2018-04-18 | 4.522 | 4.824 |
| 2018-04-19 | 4.488 | 4.821 |
| 2018-04-20 | 4.557 | 4.817 |
| 2018-04-23 | 4.497 | 4.82 |
| 2018-04-24 | 4.502 | 4.806 |
| 2018-04-25 | 4.512 | 4.8 |
| 2018-04-26 | 4.593 | 4.804 |
| 2018-04-27 | 4.506 | 4.795 |
| 2018-04-30 | 4.559 | 4.794 |
| 2018-05-01 | 4.566 | 4.802 |
| 2018-05-02 | 4.589 | 4.816 |
| 2018-05-03 | 4.524 | 4.818 |
| 2018-05-04 | 4.551 | 4.813 |
| 2018-05-07 | 4.496 | 4.817 |
| 2018-05-08 | 4.514 | 4.816 |
| 2018-05-09 | 4.48 | 4.82 |
| 2018-05-10 | 4.552 | 4.822 |
| 2018-05-11 | 4.547 | 4.837 |
| 2018-05-14 | 4.5 | 4.836 |
| 2018-05-15 | 4.586 | 4.952 |
| 2018-05-16 | 4.583 | 4.95 |
| 2018-05-17 | 4.609 | 4.959 |
| 2018-05-18 | 4.555 | 4.953 |
| 2018-05-21 | 4.53 | 4.957 |
| 2018-05-22 | 4.554 | 4.95 |
| 2018-05-23 | 4.471 | 4.948 |
| 2018-05-24 | 4.513 | 4.961 |
| 2018-05-25 | 4.588 | 4.951 |
| 2018-05-28 | 4.596 | 4.961 |
| 2018-05-29 | 4.621 | 4.951 |
| 2018-05-30 | 4.5 | 4.93 |
| 2018-05-31 | 4.492 | 4.929 |
| 2018-06-01 | 4.457 | 4.931 |
| 2018-06-04 | 4.495 | 4.946 |
| 2018-06-05 | 4.528 | 4.947 |
| 2018-06-06 | 4.569 | 4.943 |
| 2018-06-07 | 4.461 | 4.948 |
| 2018-06-08 | 4.556 | 4.933 |
| 2018-06-11 | 4.581 | 4.932 |
| 2018-06-12 | 4.492 | 4.954 |
| 2018-06-13 | 4.482 | 4.952 |
| 2018-06-14 | 4.566 | 4.955 |
| 2018-06-15 | 4.445 | 4.949 |
| 2018-06-18 | 4.547 | 4.965 |
| 2018-06-19 | 4.495 | 4.938 |
| 2018-06-20 | 4.564 | 4.937 |
| 2018-06-21 | 4.526 | 4.939 |
| 2018-06-22 | 4.506 | 4.944 |
| 2018-06-25 | 4.539 | 4.932 |
| 2018-06-26 | 4.46 | 4.919 |
| 2018-06-27 | 4.446 | 4.947 |
| 2018-06-28 | 4.444 | 4.942 |
| 2018-06-29 | 4.409 | 4.963 |
| 2018-07-02 | 4.349 | 4.916 |
| 2018-07-03 | 4.36 | 4.928 |
| 2018-07-04 | 4.375 | 4.949 |
| 2018-07-05 | 4.481 | 4.974 |
| 2018-07-06 | 4.546 | 4.972 |
| 2018-07-09 | 4.356 | 4.927 |
| 2018-07-10 | 4.335 | 4.931 |
| 2018-07-11 | 4.358 | 4.922 |
| 2018-07-12 | 4.358 | 4.905 |
| 2018-07-13 | 4.311 | 4.911 |
| 2018-07-16 | 4.267 | 4.836 |
| 2018-07-17 | 4.225 | 4.836 |
| 2018-07-18 | 4.3 | 4.838 |
| 2018-07-19 | 4.323 | 4.838 |
| 2018-07-20 | 4.164 | 4.769 |
| 2018-07-23 | 4.178 | 4.759 |